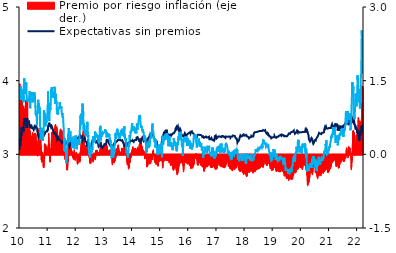
| Category | Premio por riesgo inflación (eje der.) |
|---|---|
| 2010-01-01 | 0.437 |
| 2010-01-04 | 1.435 |
| 2010-01-05 | 0.747 |
| 2010-01-06 | 1.172 |
| 2010-01-07 | 0.792 |
| 2010-01-08 | 1.109 |
| 2010-01-11 | 0.759 |
| 2010-01-12 | 0.645 |
| 2010-01-13 | 0.78 |
| 2010-01-14 | 0.892 |
| 2010-01-15 | 1.143 |
| 2010-01-18 | 1.323 |
| 2010-01-19 | 1.054 |
| 2010-01-20 | 0.948 |
| 2010-01-21 | 1.082 |
| 2010-01-22 | 0.902 |
| 2010-01-25 | 1.047 |
| 2010-01-26 | 0.965 |
| 2010-01-27 | 1.144 |
| 2010-01-28 | 0.8 |
| 2010-01-29 | 1.093 |
| 2010-02-01 | 1.084 |
| 2010-02-02 | 0.8 |
| 2010-02-03 | 0.903 |
| 2010-02-04 | 0.911 |
| 2010-02-05 | 0.894 |
| 2010-02-08 | 0.943 |
| 2010-02-09 | 0.974 |
| 2010-02-10 | 0.783 |
| 2010-02-11 | 0.743 |
| 2010-02-12 | 0.822 |
| 2010-02-15 | 0.922 |
| 2010-02-16 | 0.69 |
| 2010-02-17 | 0.694 |
| 2010-02-18 | 0.587 |
| 2010-02-19 | 0.915 |
| 2010-02-22 | 0.988 |
| 2010-02-23 | 0.779 |
| 2010-02-24 | 0.863 |
| 2010-02-25 | 0.722 |
| 2010-02-26 | 0.819 |
| 2010-03-01 | 0.888 |
| 2010-03-02 | 0.849 |
| 2010-03-03 | 0.8 |
| 2010-03-04 | 0.919 |
| 2010-03-05 | 0.868 |
| 2010-03-08 | 0.931 |
| 2010-03-09 | 0.779 |
| 2010-03-10 | 0.929 |
| 2010-03-11 | 0.758 |
| 2010-03-12 | 0.853 |
| 2010-03-15 | 0.615 |
| 2010-03-16 | 0.704 |
| 2010-03-17 | 0.689 |
| 2010-03-18 | 0.763 |
| 2010-03-19 | 1.072 |
| 2010-03-22 | 1.111 |
| 2010-03-23 | 1.083 |
| 2010-03-24 | 0.844 |
| 2010-03-25 | 0.927 |
| 2010-03-26 | 0.847 |
| 2010-03-29 | 0.821 |
| 2010-03-30 | 0.89 |
| 2010-03-31 | 1.185 |
| 2010-04-01 | 0.962 |
| 2010-04-02 | 0.962 |
| 2010-04-05 | 0.898 |
| 2010-04-06 | 0.86 |
| 2010-04-07 | 0.802 |
| 2010-04-08 | 0.709 |
| 2010-04-09 | 0.594 |
| 2010-04-12 | 1.137 |
| 2010-04-13 | 0.524 |
| 2010-04-14 | 0.622 |
| 2010-04-15 | 0.427 |
| 2010-04-16 | 0.212 |
| 2010-04-19 | 0.152 |
| 2010-04-20 | 0.221 |
| 2010-04-21 | 0.225 |
| 2010-04-22 | 0.392 |
| 2010-04-23 | 0.349 |
| 2010-04-26 | 0.366 |
| 2010-04-27 | 0.374 |
| 2010-04-28 | 0.43 |
| 2010-04-29 | 0.397 |
| 2010-04-30 | 0.475 |
| 2010-05-03 | 0.615 |
| 2010-05-04 | 0.496 |
| 2010-05-05 | 0.511 |
| 2010-05-06 | 0.608 |
| 2010-05-07 | 0.44 |
| 2010-05-10 | 0.519 |
| 2010-05-11 | 0.434 |
| 2010-05-12 | 0.437 |
| 2010-05-13 | 0.46 |
| 2010-05-14 | 0.428 |
| 2010-05-17 | 0.461 |
| 2010-05-18 | 0.411 |
| 2010-05-19 | 0.414 |
| 2010-05-20 | 0.389 |
| 2010-05-21 | 0.389 |
| 2010-05-24 | 0.229 |
| 2010-05-25 | 0.184 |
| 2010-05-26 | 0.168 |
| 2010-05-27 | 0.237 |
| 2010-05-28 | 0.24 |
| 2010-05-31 | 0.233 |
| 2010-06-01 | 0.229 |
| 2010-06-02 | 0.276 |
| 2010-06-03 | 0.297 |
| 2010-06-04 | 0.28 |
| 2010-06-07 | 0.327 |
| 2010-06-08 | 0.325 |
| 2010-06-09 | 0.33 |
| 2010-06-10 | 0.367 |
| 2010-06-11 | 0.369 |
| 2010-06-14 | 0.385 |
| 2010-06-15 | 0.358 |
| 2010-06-16 | 0.432 |
| 2010-06-17 | 0.445 |
| 2010-06-18 | 0.415 |
| 2010-06-21 | 0.397 |
| 2010-06-22 | 0.313 |
| 2010-06-23 | 0.291 |
| 2010-06-24 | 0.332 |
| 2010-06-25 | 0.332 |
| 2010-06-28 | 0.332 |
| 2010-06-29 | 0.322 |
| 2010-06-30 | 0.313 |
| 2010-07-01 | 0.319 |
| 2010-07-02 | 0.325 |
| 2010-07-05 | 0.308 |
| 2010-07-06 | 0.307 |
| 2010-07-07 | 0.362 |
| 2010-07-08 | 0.346 |
| 2010-07-09 | 0.359 |
| 2010-07-12 | 0.369 |
| 2010-07-13 | 0.413 |
| 2010-07-14 | 0.416 |
| 2010-07-15 | 0.418 |
| 2010-07-16 | 0.418 |
| 2010-07-19 | 0.415 |
| 2010-07-20 | 0.427 |
| 2010-07-21 | 0.43 |
| 2010-07-22 | 0.418 |
| 2010-07-23 | 0.414 |
| 2010-07-26 | 0.412 |
| 2010-07-27 | 0.409 |
| 2010-07-28 | 0.392 |
| 2010-07-29 | 0.286 |
| 2010-07-30 | 0.278 |
| 2010-08-02 | 0.273 |
| 2010-08-03 | 0.169 |
| 2010-08-04 | 0.148 |
| 2010-08-05 | 0.148 |
| 2010-08-06 | 0.112 |
| 2010-08-09 | 0.156 |
| 2010-08-10 | 0.147 |
| 2010-08-11 | 0.064 |
| 2010-08-12 | 0.052 |
| 2010-08-13 | 0.091 |
| 2010-08-16 | 0.067 |
| 2010-08-17 | 0.08 |
| 2010-08-18 | 0.075 |
| 2010-08-19 | -0.002 |
| 2010-08-20 | -0.025 |
| 2010-08-23 | -0.024 |
| 2010-08-24 | 0.074 |
| 2010-08-25 | 0.127 |
| 2010-08-26 | 0.226 |
| 2010-08-27 | 0.262 |
| 2010-08-30 | 0.276 |
| 2010-08-31 | 0.316 |
| 2010-09-01 | 0.39 |
| 2010-09-02 | 0.368 |
| 2010-09-03 | 0.406 |
| 2010-09-06 | 0.46 |
| 2010-09-07 | 0.491 |
| 2010-09-08 | 0.527 |
| 2010-09-09 | 0.493 |
| 2010-09-10 | 0.489 |
| 2010-09-13 | 0.495 |
| 2010-09-14 | 0.499 |
| 2010-09-15 | 0.432 |
| 2010-09-16 | 0.477 |
| 2010-09-17 | 0.477 |
| 2010-09-20 | 0.477 |
| 2010-09-21 | 0.415 |
| 2010-09-22 | 0.408 |
| 2010-09-23 | 0.346 |
| 2010-09-24 | 0.388 |
| 2010-09-27 | 0.426 |
| 2010-09-28 | 0.424 |
| 2010-09-29 | 0.354 |
| 2010-09-30 | 0.166 |
| 2010-10-01 | 0.187 |
| 2010-10-04 | 0.115 |
| 2010-10-05 | 0.044 |
| 2010-10-06 | 0.015 |
| 2010-10-07 | -0.025 |
| 2010-10-08 | -0.108 |
| 2010-10-11 | -0.108 |
| 2010-10-12 | -0.126 |
| 2010-10-13 | -0.15 |
| 2010-10-14 | -0.147 |
| 2010-10-15 | -0.139 |
| 2010-10-18 | -0.131 |
| 2010-10-19 | -0.082 |
| 2010-10-20 | -0.012 |
| 2010-10-21 | 0.041 |
| 2010-10-22 | 0.046 |
| 2010-10-25 | -0.012 |
| 2010-10-26 | -0.063 |
| 2010-10-27 | -0.116 |
| 2010-10-28 | -0.097 |
| 2010-10-29 | -0.084 |
| 2010-11-01 | -0.084 |
| 2010-11-02 | -0.124 |
| 2010-11-03 | -0.219 |
| 2010-11-04 | -0.256 |
| 2010-11-05 | -0.254 |
| 2010-11-08 | -0.26 |
| 2010-11-09 | -0.26 |
| 2010-11-10 | -0.195 |
| 2010-11-11 | -0.159 |
| 2010-11-12 | -0.071 |
| 2010-11-15 | -0.091 |
| 2010-11-16 | -0.087 |
| 2010-11-17 | -0.08 |
| 2010-11-18 | 0.054 |
| 2010-11-19 | 0.198 |
| 2010-11-22 | 0.218 |
| 2010-11-23 | 0.167 |
| 2010-11-24 | 0.138 |
| 2010-11-25 | 0.14 |
| 2010-11-26 | 0.158 |
| 2010-11-29 | 0.163 |
| 2010-11-30 | 0.2 |
| 2010-12-01 | 0.178 |
| 2010-12-02 | 0.196 |
| 2010-12-03 | 0.163 |
| 2010-12-06 | 0.169 |
| 2010-12-07 | 0.115 |
| 2010-12-08 | 0.115 |
| 2010-12-09 | 0.145 |
| 2010-12-10 | 0.008 |
| 2010-12-13 | 0.014 |
| 2010-12-14 | 0.062 |
| 2010-12-15 | 0.123 |
| 2010-12-16 | 0.149 |
| 2010-12-17 | 0.113 |
| 2010-12-20 | 0.118 |
| 2010-12-21 | 0.079 |
| 2010-12-22 | 0.064 |
| 2010-12-23 | 0.039 |
| 2010-12-24 | 0.036 |
| 2010-12-27 | 0.061 |
| 2010-12-28 | 0.057 |
| 2010-12-29 | 0.081 |
| 2010-12-30 | 0.079 |
| 2010-12-31 | 0.079 |
| 2011-01-03 | 0.08 |
| 2011-01-04 | 0.114 |
| 2011-01-05 | 0.16 |
| 2011-01-06 | 0.136 |
| 2011-01-07 | 0.197 |
| 2011-01-10 | 0.219 |
| 2011-01-11 | 0.268 |
| 2011-01-12 | 0.432 |
| 2011-01-13 | 0.348 |
| 2011-01-14 | 0.215 |
| 2011-01-17 | 0.206 |
| 2011-01-18 | 0.136 |
| 2011-01-19 | 0.061 |
| 2011-01-20 | -0.005 |
| 2011-01-21 | 0 |
| 2011-01-24 | -0.012 |
| 2011-01-25 | -0.093 |
| 2011-01-26 | -0.12 |
| 2011-01-27 | -0.143 |
| 2011-01-28 | -0.149 |
| 2011-01-31 | -0.127 |
| 2011-02-01 | -0.094 |
| 2011-02-02 | -0.093 |
| 2011-02-03 | 0.069 |
| 2011-02-04 | 0.105 |
| 2011-02-07 | 0.125 |
| 2011-02-08 | 0.102 |
| 2011-02-09 | 0.078 |
| 2011-02-10 | 0.077 |
| 2011-02-11 | 0.09 |
| 2011-02-14 | 0.112 |
| 2011-02-15 | 0.119 |
| 2011-02-16 | 0.228 |
| 2011-02-17 | 0.275 |
| 2011-02-18 | 0.312 |
| 2011-02-21 | 0.368 |
| 2011-02-22 | 0.455 |
| 2011-02-23 | 0.415 |
| 2011-02-24 | 0.42 |
| 2011-02-25 | 0.397 |
| 2011-02-28 | 0.408 |
| 2011-03-01 | 0.444 |
| 2011-03-02 | 0.449 |
| 2011-03-03 | 0.419 |
| 2011-03-04 | 0.35 |
| 2011-03-07 | 0.331 |
| 2011-03-08 | 0.34 |
| 2011-03-09 | 0.324 |
| 2011-03-10 | 0.352 |
| 2011-03-11 | 0.387 |
| 2011-03-14 | 0.445 |
| 2011-03-15 | 0.479 |
| 2011-03-16 | 0.461 |
| 2011-03-17 | 0.478 |
| 2011-03-18 | 0.456 |
| 2011-03-21 | 0.472 |
| 2011-03-22 | 0.46 |
| 2011-03-23 | 0.472 |
| 2011-03-24 | 0.461 |
| 2011-03-25 | 0.479 |
| 2011-03-28 | 0.495 |
| 2011-03-29 | 0.516 |
| 2011-03-30 | 0.514 |
| 2011-03-31 | 0.484 |
| 2011-04-01 | 0.516 |
| 2011-04-04 | 0.534 |
| 2011-04-05 | 0.528 |
| 2011-04-06 | 0.554 |
| 2011-04-07 | 0.599 |
| 2011-04-08 | 0.597 |
| 2011-04-11 | 0.609 |
| 2011-04-12 | 0.498 |
| 2011-04-13 | 0.438 |
| 2011-04-14 | 0.415 |
| 2011-04-15 | 0.387 |
| 2011-04-18 | 0.408 |
| 2011-04-19 | 0.491 |
| 2011-04-20 | 0.542 |
| 2011-04-21 | 0.543 |
| 2011-04-22 | 0.543 |
| 2011-04-25 | 0.54 |
| 2011-04-26 | 0.564 |
| 2011-04-27 | 0.528 |
| 2011-04-28 | 0.495 |
| 2011-04-29 | 0.456 |
| 2011-05-02 | 0.471 |
| 2011-05-03 | 0.475 |
| 2011-05-04 | 0.451 |
| 2011-05-05 | 0.394 |
| 2011-05-06 | 0.348 |
| 2011-05-09 | 0.33 |
| 2011-05-10 | 0.357 |
| 2011-05-11 | 0.327 |
| 2011-05-12 | 0.349 |
| 2011-05-13 | 0.346 |
| 2011-05-16 | 0.337 |
| 2011-05-17 | 0.337 |
| 2011-05-18 | 0.342 |
| 2011-05-19 | 0.319 |
| 2011-05-20 | 0.297 |
| 2011-05-23 | 0.291 |
| 2011-05-24 | 0.285 |
| 2011-05-25 | 0.277 |
| 2011-05-26 | 0.286 |
| 2011-05-27 | 0.37 |
| 2011-05-30 | 0.386 |
| 2011-05-31 | 0.389 |
| 2011-06-01 | 0.386 |
| 2011-06-02 | 0.409 |
| 2011-06-03 | 0.418 |
| 2011-06-06 | 0.426 |
| 2011-06-07 | 0.431 |
| 2011-06-08 | 0.427 |
| 2011-06-09 | 0.461 |
| 2011-06-10 | 0.463 |
| 2011-06-13 | 0.514 |
| 2011-06-14 | 0.516 |
| 2011-06-15 | 0.486 |
| 2011-06-16 | 0.483 |
| 2011-06-17 | 0.49 |
| 2011-06-20 | 0.49 |
| 2011-06-21 | 0.494 |
| 2011-06-22 | 0.472 |
| 2011-06-23 | 0.459 |
| 2011-06-24 | 0.453 |
| 2011-06-27 | 0.453 |
| 2011-06-28 | 0.446 |
| 2011-06-29 | 0.444 |
| 2011-06-30 | 0.463 |
| 2011-07-01 | 0.463 |
| 2011-07-04 | 0.456 |
| 2011-07-05 | 0.478 |
| 2011-07-06 | 0.46 |
| 2011-07-07 | 0.427 |
| 2011-07-08 | 0.404 |
| 2011-07-11 | 0.388 |
| 2011-07-12 | 0.383 |
| 2011-07-13 | 0.395 |
| 2011-07-14 | 0.378 |
| 2011-07-15 | 0.374 |
| 2011-07-18 | 0.391 |
| 2011-07-19 | 0.411 |
| 2011-07-20 | 0.377 |
| 2011-07-21 | 0.364 |
| 2011-07-22 | 0.326 |
| 2011-07-25 | 0.334 |
| 2011-07-26 | 0.348 |
| 2011-07-27 | 0.333 |
| 2011-07-28 | 0.313 |
| 2011-07-29 | 0.273 |
| 2011-08-01 | 0.257 |
| 2011-08-02 | 0.23 |
| 2011-08-03 | 0.196 |
| 2011-08-04 | 0.132 |
| 2011-08-05 | 0.083 |
| 2011-08-08 | 0.064 |
| 2011-08-09 | 0.017 |
| 2011-08-10 | -0.093 |
| 2011-08-11 | -0.038 |
| 2011-08-12 | 0.017 |
| 2011-08-15 | 0.017 |
| 2011-08-16 | 0.041 |
| 2011-08-17 | 0.096 |
| 2011-08-18 | 0.055 |
| 2011-08-19 | -0.081 |
| 2011-08-22 | -0.03 |
| 2011-08-23 | -0.069 |
| 2011-08-24 | -0.071 |
| 2011-08-25 | -0.103 |
| 2011-08-26 | -0.092 |
| 2011-08-29 | -0.06 |
| 2011-08-30 | -0.079 |
| 2011-08-31 | -0.068 |
| 2011-09-01 | -0.075 |
| 2011-09-02 | -0.136 |
| 2011-09-05 | -0.236 |
| 2011-09-06 | -0.312 |
| 2011-09-07 | -0.302 |
| 2011-09-08 | -0.29 |
| 2011-09-09 | -0.249 |
| 2011-09-12 | -0.299 |
| 2011-09-13 | -0.261 |
| 2011-09-14 | -0.199 |
| 2011-09-15 | -0.155 |
| 2011-09-16 | -0.137 |
| 2011-09-19 | -0.137 |
| 2011-09-20 | -0.087 |
| 2011-09-21 | 0.013 |
| 2011-09-22 | 0.009 |
| 2011-09-23 | 0.022 |
| 2011-09-26 | -0.028 |
| 2011-09-27 | -0.025 |
| 2011-09-28 | -0.017 |
| 2011-09-29 | 0.051 |
| 2011-09-30 | 0.128 |
| 2011-10-03 | 0.117 |
| 2011-10-04 | 0.087 |
| 2011-10-05 | 0.144 |
| 2011-10-06 | 0.18 |
| 2011-10-07 | 0.235 |
| 2011-10-10 | 0.235 |
| 2011-10-11 | 0.256 |
| 2011-10-12 | 0.22 |
| 2011-10-13 | 0.2 |
| 2011-10-14 | 0.177 |
| 2011-10-17 | 0.112 |
| 2011-10-18 | 0.051 |
| 2011-10-19 | 0.038 |
| 2011-10-20 | -0.005 |
| 2011-10-21 | 0.032 |
| 2011-10-24 | 0.062 |
| 2011-10-25 | 0.054 |
| 2011-10-26 | 0.044 |
| 2011-10-27 | 0.163 |
| 2011-10-28 | 0.114 |
| 2011-10-31 | 0.114 |
| 2011-11-01 | 0.114 |
| 2011-11-02 | 0.082 |
| 2011-11-03 | 0.068 |
| 2011-11-04 | 0.06 |
| 2011-11-07 | 0.073 |
| 2011-11-08 | 0.053 |
| 2011-11-09 | 0.055 |
| 2011-11-10 | 0.042 |
| 2011-11-11 | 0.037 |
| 2011-11-14 | 0.01 |
| 2011-11-15 | -0.01 |
| 2011-11-16 | 0.029 |
| 2011-11-17 | -0.004 |
| 2011-11-18 | -0.033 |
| 2011-11-21 | 0.013 |
| 2011-11-22 | -0.042 |
| 2011-11-23 | -0.058 |
| 2011-11-24 | -0.061 |
| 2011-11-25 | -0.05 |
| 2011-11-28 | -0.053 |
| 2011-11-29 | -0.095 |
| 2011-11-30 | -0.08 |
| 2011-12-01 | 0.014 |
| 2011-12-02 | 0.023 |
| 2011-12-05 | 0.025 |
| 2011-12-06 | 0.013 |
| 2011-12-07 | 0.052 |
| 2011-12-08 | 0.052 |
| 2011-12-09 | 0.096 |
| 2011-12-12 | 0.012 |
| 2011-12-13 | -0.006 |
| 2011-12-14 | -0.018 |
| 2011-12-15 | -0.033 |
| 2011-12-16 | -0.039 |
| 2011-12-19 | -0.044 |
| 2011-12-20 | -0.093 |
| 2011-12-21 | -0.117 |
| 2011-12-22 | -0.095 |
| 2011-12-23 | -0.086 |
| 2011-12-26 | -0.085 |
| 2011-12-27 | -0.074 |
| 2011-12-28 | -0.052 |
| 2011-12-29 | -0.033 |
| 2011-12-30 | -0.034 |
| 2012-01-02 | 0.013 |
| 2012-01-03 | 0.039 |
| 2012-01-04 | 0.022 |
| 2012-01-05 | 0.04 |
| 2012-01-06 | 0.017 |
| 2012-01-09 | -0.009 |
| 2012-01-10 | -0.021 |
| 2012-01-11 | -0.019 |
| 2012-01-12 | -0.019 |
| 2012-01-13 | -0.014 |
| 2012-01-16 | -0.009 |
| 2012-01-17 | -0.07 |
| 2012-01-18 | -0.134 |
| 2012-01-19 | -0.17 |
| 2012-01-20 | -0.192 |
| 2012-01-23 | -0.186 |
| 2012-01-24 | -0.162 |
| 2012-01-25 | -0.164 |
| 2012-01-26 | -0.114 |
| 2012-01-27 | -0.048 |
| 2012-01-30 | -0.107 |
| 2012-01-31 | -0.061 |
| 2012-02-01 | -0.09 |
| 2012-02-02 | -0.062 |
| 2012-02-03 | -0.093 |
| 2012-02-06 | -0.086 |
| 2012-02-07 | -0.08 |
| 2012-02-08 | -0.093 |
| 2012-02-09 | -0.11 |
| 2012-02-10 | -0.118 |
| 2012-02-13 | -0.123 |
| 2012-02-14 | -0.108 |
| 2012-02-15 | -0.115 |
| 2012-02-16 | -0.127 |
| 2012-02-17 | -0.138 |
| 2012-02-20 | -0.151 |
| 2012-02-21 | -0.087 |
| 2012-02-22 | -0.106 |
| 2012-02-23 | -0.062 |
| 2012-02-24 | 0.019 |
| 2012-02-27 | 0.04 |
| 2012-02-28 | 0.075 |
| 2012-02-29 | 0.052 |
| 2012-03-01 | 0.04 |
| 2012-03-02 | 0.069 |
| 2012-03-05 | 0.121 |
| 2012-03-06 | 0.091 |
| 2012-03-07 | 0.126 |
| 2012-03-08 | 0.238 |
| 2012-03-09 | 0.198 |
| 2012-03-12 | 0.148 |
| 2012-03-13 | 0.181 |
| 2012-03-14 | 0.287 |
| 2012-03-15 | 0.217 |
| 2012-03-16 | 0.21 |
| 2012-03-19 | 0.258 |
| 2012-03-20 | 0.23 |
| 2012-03-21 | 0.171 |
| 2012-03-22 | 0.138 |
| 2012-03-23 | 0.16 |
| 2012-03-26 | 0.143 |
| 2012-03-27 | 0.133 |
| 2012-03-28 | 0.129 |
| 2012-03-29 | 0.195 |
| 2012-03-30 | 0.349 |
| 2012-04-02 | 0.42 |
| 2012-04-03 | 0.402 |
| 2012-04-04 | 0.438 |
| 2012-04-05 | 0.483 |
| 2012-04-06 | 0.483 |
| 2012-04-09 | 0.483 |
| 2012-04-10 | 0.427 |
| 2012-04-11 | 0.366 |
| 2012-04-12 | 0.382 |
| 2012-04-13 | 0.292 |
| 2012-04-16 | 0.226 |
| 2012-04-17 | 0.191 |
| 2012-04-18 | 0.145 |
| 2012-04-19 | 0.087 |
| 2012-04-20 | 0.149 |
| 2012-04-23 | 0.153 |
| 2012-04-24 | 0.194 |
| 2012-04-25 | 0.139 |
| 2012-04-26 | 0.137 |
| 2012-04-27 | 0.169 |
| 2012-04-30 | 0.17 |
| 2012-05-01 | 0.17 |
| 2012-05-02 | 0.104 |
| 2012-05-03 | 0.043 |
| 2012-05-04 | 0.027 |
| 2012-05-07 | 0.093 |
| 2012-05-08 | 0.093 |
| 2012-05-09 | 0.087 |
| 2012-05-10 | 0.112 |
| 2012-05-11 | 0.112 |
| 2012-05-14 | 0.13 |
| 2012-05-15 | 0.084 |
| 2012-05-16 | 0.079 |
| 2012-05-17 | 0.085 |
| 2012-05-18 | 0.128 |
| 2012-05-21 | 0.128 |
| 2012-05-22 | 0.134 |
| 2012-05-23 | 0.058 |
| 2012-05-24 | 0.045 |
| 2012-05-25 | 0.093 |
| 2012-05-28 | 0.098 |
| 2012-05-29 | 0.156 |
| 2012-05-30 | 0.131 |
| 2012-05-31 | 0.159 |
| 2012-06-01 | 0.252 |
| 2012-06-04 | 0.288 |
| 2012-06-05 | 0.31 |
| 2012-06-06 | 0.297 |
| 2012-06-07 | 0.29 |
| 2012-06-08 | 0.274 |
| 2012-06-11 | 0.243 |
| 2012-06-12 | 0.177 |
| 2012-06-13 | 0.127 |
| 2012-06-14 | 0.071 |
| 2012-06-15 | 0.064 |
| 2012-06-18 | 0.097 |
| 2012-06-19 | 0.043 |
| 2012-06-20 | 0.018 |
| 2012-06-21 | -0.055 |
| 2012-06-22 | -0.053 |
| 2012-06-25 | -0.071 |
| 2012-06-26 | -0.073 |
| 2012-06-27 | -0.136 |
| 2012-06-28 | -0.169 |
| 2012-06-29 | -0.075 |
| 2012-07-02 | -0.075 |
| 2012-07-03 | -0.013 |
| 2012-07-04 | -0.048 |
| 2012-07-05 | -0.18 |
| 2012-07-06 | -0.136 |
| 2012-07-09 | -0.126 |
| 2012-07-10 | -0.101 |
| 2012-07-11 | -0.12 |
| 2012-07-12 | -0.174 |
| 2012-07-13 | -0.087 |
| 2012-07-16 | -0.087 |
| 2012-07-17 | -0.041 |
| 2012-07-18 | -0.01 |
| 2012-07-19 | -0.093 |
| 2012-07-20 | -0.109 |
| 2012-07-23 | -0.111 |
| 2012-07-24 | -0.104 |
| 2012-07-25 | -0.103 |
| 2012-07-26 | -0.128 |
| 2012-07-27 | -0.034 |
| 2012-07-30 | -0.031 |
| 2012-07-31 | -0.123 |
| 2012-08-01 | -0.115 |
| 2012-08-02 | -0.091 |
| 2012-08-03 | -0.064 |
| 2012-08-06 | -0.116 |
| 2012-08-07 | -0.12 |
| 2012-08-08 | -0.1 |
| 2012-08-09 | -0.15 |
| 2012-08-10 | -0.131 |
| 2012-08-13 | -0.126 |
| 2012-08-14 | -0.076 |
| 2012-08-15 | -0.076 |
| 2012-08-16 | -0.011 |
| 2012-08-17 | -0.044 |
| 2012-08-20 | -0.028 |
| 2012-08-21 | 0.033 |
| 2012-08-22 | 0.011 |
| 2012-08-23 | -0.02 |
| 2012-08-24 | -0.065 |
| 2012-08-27 | -0.048 |
| 2012-08-28 | -0.035 |
| 2012-08-29 | -0.055 |
| 2012-08-30 | -0.049 |
| 2012-08-31 | -0.044 |
| 2012-09-03 | -0.072 |
| 2012-09-04 | -0.081 |
| 2012-09-05 | -0.105 |
| 2012-09-06 | -0.064 |
| 2012-09-07 | -0.076 |
| 2012-09-10 | -0.072 |
| 2012-09-11 | -0.049 |
| 2012-09-12 | 0.004 |
| 2012-09-13 | 0.028 |
| 2012-09-14 | 0.079 |
| 2012-09-17 | 0.079 |
| 2012-09-18 | 0.079 |
| 2012-09-19 | 0.079 |
| 2012-09-20 | 0.069 |
| 2012-09-21 | 0.053 |
| 2012-09-24 | 0.046 |
| 2012-09-25 | 0.042 |
| 2012-09-26 | 0.048 |
| 2012-09-27 | 0.081 |
| 2012-09-28 | 0.082 |
| 2012-10-01 | 0.08 |
| 2012-10-02 | 0.056 |
| 2012-10-03 | 0.056 |
| 2012-10-04 | 0.048 |
| 2012-10-05 | 0.044 |
| 2012-10-08 | 0.053 |
| 2012-10-09 | 0.017 |
| 2012-10-10 | 0.022 |
| 2012-10-11 | 0.042 |
| 2012-10-12 | 0.03 |
| 2012-10-15 | 0.03 |
| 2012-10-16 | 0.008 |
| 2012-10-17 | 0.006 |
| 2012-10-18 | 0.007 |
| 2012-10-19 | 0.001 |
| 2012-10-22 | 0.014 |
| 2012-10-23 | 0.009 |
| 2012-10-24 | 0.006 |
| 2012-10-25 | 0.03 |
| 2012-10-26 | -0.008 |
| 2012-10-29 | -0.01 |
| 2012-10-30 | 0 |
| 2012-10-31 | -0.003 |
| 2012-11-01 | -0.003 |
| 2012-11-02 | -0.003 |
| 2012-11-05 | 0.023 |
| 2012-11-06 | 0.043 |
| 2012-11-07 | 0.032 |
| 2012-11-08 | 0.093 |
| 2012-11-09 | 0.061 |
| 2012-11-12 | 0.078 |
| 2012-11-13 | 0.138 |
| 2012-11-14 | 0.156 |
| 2012-11-15 | 0.172 |
| 2012-11-16 | 0.222 |
| 2012-11-19 | 0.219 |
| 2012-11-20 | 0.179 |
| 2012-11-21 | 0.218 |
| 2012-11-22 | 0.238 |
| 2012-11-23 | 0.254 |
| 2012-11-26 | 0.214 |
| 2012-11-27 | 0.047 |
| 2012-11-28 | 0.002 |
| 2012-11-29 | 0.019 |
| 2012-11-30 | 0.044 |
| 2012-12-03 | 0.048 |
| 2012-12-04 | 0.065 |
| 2012-12-05 | 0.072 |
| 2012-12-06 | 0.105 |
| 2012-12-07 | 0.091 |
| 2012-12-10 | 0.112 |
| 2012-12-11 | 0.116 |
| 2012-12-12 | 0.122 |
| 2012-12-13 | 0.158 |
| 2012-12-14 | 0.143 |
| 2012-12-17 | 0.155 |
| 2012-12-18 | 0.158 |
| 2012-12-19 | 0.158 |
| 2012-12-20 | 0.171 |
| 2012-12-21 | 0.169 |
| 2012-12-24 | 0.166 |
| 2012-12-25 | 0.166 |
| 2012-12-26 | 0.148 |
| 2012-12-27 | 0.145 |
| 2012-12-28 | 0.143 |
| 2012-12-31 | 0.143 |
| 2013-01-01 | 0.143 |
| 2013-01-02 | 0.135 |
| 2013-01-03 | 0.149 |
| 2013-01-04 | 0.163 |
| 2013-01-07 | 0.158 |
| 2013-01-08 | 0.129 |
| 2013-01-09 | 0.133 |
| 2013-01-10 | 0.141 |
| 2013-01-11 | 0.149 |
| 2013-01-14 | 0.142 |
| 2013-01-15 | 0.142 |
| 2013-01-16 | 0.14 |
| 2013-01-17 | 0.138 |
| 2013-01-18 | 0.15 |
| 2013-01-21 | 0.148 |
| 2013-01-22 | 0.18 |
| 2013-01-23 | 0.192 |
| 2013-01-24 | 0.142 |
| 2013-01-25 | 0.145 |
| 2013-01-28 | 0.184 |
| 2013-01-29 | 0.197 |
| 2013-01-30 | 0.2 |
| 2013-01-31 | 0.199 |
| 2013-02-01 | 0.174 |
| 2013-02-04 | 0.166 |
| 2013-02-05 | 0.161 |
| 2013-02-06 | 0.138 |
| 2013-02-07 | 0.103 |
| 2013-02-08 | 0.078 |
| 2013-02-11 | 0.058 |
| 2013-02-12 | 0.006 |
| 2013-02-13 | 0.059 |
| 2013-02-14 | 0.078 |
| 2013-02-15 | 0.061 |
| 2013-02-18 | 0.073 |
| 2013-02-19 | 0.078 |
| 2013-02-20 | 0.079 |
| 2013-02-21 | 0.05 |
| 2013-02-22 | 0.043 |
| 2013-02-25 | 0.024 |
| 2013-02-26 | 0.016 |
| 2013-02-27 | 0.031 |
| 2013-02-28 | 0.05 |
| 2013-03-01 | 0.035 |
| 2013-03-04 | 0.041 |
| 2013-03-05 | 0.056 |
| 2013-03-06 | 0.079 |
| 2013-03-07 | 0.077 |
| 2013-03-08 | 0.064 |
| 2013-03-11 | 0.058 |
| 2013-03-12 | 0.082 |
| 2013-03-13 | 0.056 |
| 2013-03-14 | 0.058 |
| 2013-03-15 | 0.077 |
| 2013-03-18 | 0.099 |
| 2013-03-19 | 0.08 |
| 2013-03-20 | 0.07 |
| 2013-03-21 | 0.068 |
| 2013-03-22 | 0.049 |
| 2013-03-25 | 0.065 |
| 2013-03-26 | 0.056 |
| 2013-03-27 | 0.049 |
| 2013-03-28 | 0.001 |
| 2013-03-29 | 0.001 |
| 2013-04-01 | 0.03 |
| 2013-04-02 | 0.049 |
| 2013-04-03 | 0.062 |
| 2013-04-04 | 0.012 |
| 2013-04-05 | -0.028 |
| 2013-04-08 | -0.043 |
| 2013-04-09 | -0.051 |
| 2013-04-10 | -0.061 |
| 2013-04-11 | -0.062 |
| 2013-04-12 | -0.02 |
| 2013-04-15 | -0.046 |
| 2013-04-16 | -0.179 |
| 2013-04-17 | -0.208 |
| 2013-04-18 | -0.145 |
| 2013-04-19 | -0.123 |
| 2013-04-22 | -0.1 |
| 2013-04-23 | -0.097 |
| 2013-04-24 | -0.083 |
| 2013-04-25 | -0.113 |
| 2013-04-26 | -0.132 |
| 2013-04-29 | -0.148 |
| 2013-04-30 | -0.157 |
| 2013-05-01 | -0.157 |
| 2013-05-02 | -0.132 |
| 2013-05-03 | -0.098 |
| 2013-05-06 | -0.048 |
| 2013-05-07 | -0.045 |
| 2013-05-08 | -0.151 |
| 2013-05-09 | -0.168 |
| 2013-05-10 | -0.096 |
| 2013-05-13 | -0.045 |
| 2013-05-14 | -0.003 |
| 2013-05-15 | -0.019 |
| 2013-05-16 | -0.072 |
| 2013-05-17 | -0.061 |
| 2013-05-20 | -0.128 |
| 2013-05-21 | -0.128 |
| 2013-05-22 | -0.089 |
| 2013-05-23 | -0.082 |
| 2013-05-24 | -0.065 |
| 2013-05-27 | -0.073 |
| 2013-05-28 | -0.053 |
| 2013-05-29 | -0.059 |
| 2013-05-30 | -0.056 |
| 2013-05-31 | -0.034 |
| 2013-06-03 | 0.052 |
| 2013-06-04 | 0.08 |
| 2013-06-05 | 0.066 |
| 2013-06-06 | 0.114 |
| 2013-06-07 | 0.118 |
| 2013-06-10 | 0.055 |
| 2013-06-11 | 0.051 |
| 2013-06-12 | 0.045 |
| 2013-06-13 | 0.009 |
| 2013-06-14 | 0.033 |
| 2013-06-17 | 0.048 |
| 2013-06-18 | 0.071 |
| 2013-06-19 | 0.078 |
| 2013-06-20 | 0.106 |
| 2013-06-21 | 0.088 |
| 2013-06-24 | 0.101 |
| 2013-06-25 | 0.09 |
| 2013-06-26 | 0.084 |
| 2013-06-27 | 0.11 |
| 2013-06-28 | 0.175 |
| 2013-07-01 | 0.195 |
| 2013-07-02 | 0.167 |
| 2013-07-03 | 0.16 |
| 2013-07-04 | 0.156 |
| 2013-07-05 | 0.128 |
| 2013-07-08 | 0.126 |
| 2013-07-09 | 0.092 |
| 2013-07-10 | 0.061 |
| 2013-07-11 | 0.077 |
| 2013-07-12 | 0.065 |
| 2013-07-15 | 0.027 |
| 2013-07-16 | 0.027 |
| 2013-07-17 | 0.027 |
| 2013-07-18 | 0.029 |
| 2013-07-19 | 0.028 |
| 2013-07-22 | 0.02 |
| 2013-07-23 | 0.016 |
| 2013-07-24 | 0.046 |
| 2013-07-25 | 0.02 |
| 2013-07-26 | 0.012 |
| 2013-07-29 | 0.015 |
| 2013-07-30 | -0.01 |
| 2013-07-31 | 0.016 |
| 2013-08-01 | 0.046 |
| 2013-08-02 | 0.016 |
| 2013-08-05 | 0.025 |
| 2013-08-06 | 0.032 |
| 2013-08-07 | 0.04 |
| 2013-08-08 | 0.046 |
| 2013-08-09 | 0.049 |
| 2013-08-12 | 0.052 |
| 2013-08-13 | 0.04 |
| 2013-08-14 | 0.056 |
| 2013-08-15 | 0.056 |
| 2013-08-16 | 0.123 |
| 2013-08-19 | 0.119 |
| 2013-08-20 | 0.121 |
| 2013-08-21 | 0.119 |
| 2013-08-22 | 0.112 |
| 2013-08-23 | 0.091 |
| 2013-08-26 | 0.059 |
| 2013-08-27 | 0.035 |
| 2013-08-28 | 0.029 |
| 2013-08-29 | 0.052 |
| 2013-08-30 | 0.104 |
| 2013-09-02 | 0.086 |
| 2013-09-03 | 0.107 |
| 2013-09-04 | 0.072 |
| 2013-09-05 | 0.136 |
| 2013-09-06 | 0.083 |
| 2013-09-09 | 0.092 |
| 2013-09-10 | 0.115 |
| 2013-09-11 | 0.061 |
| 2013-09-12 | 0.079 |
| 2013-09-13 | 0.05 |
| 2013-09-16 | 0.058 |
| 2013-09-17 | 0.061 |
| 2013-09-18 | 0.061 |
| 2013-09-19 | 0.061 |
| 2013-09-20 | 0.061 |
| 2013-09-23 | 0.059 |
| 2013-09-24 | 0.058 |
| 2013-09-25 | 0.099 |
| 2013-09-26 | 0.152 |
| 2013-09-27 | 0.186 |
| 2013-09-30 | 0.244 |
| 2013-10-01 | 0.202 |
| 2013-10-02 | 0.161 |
| 2013-10-03 | 0.116 |
| 2013-10-04 | 0.075 |
| 2013-10-07 | 0.129 |
| 2013-10-08 | 0.101 |
| 2013-10-09 | 0.044 |
| 2013-10-10 | 0.059 |
| 2013-10-11 | 0.038 |
| 2013-10-14 | 0.042 |
| 2013-10-15 | 0.039 |
| 2013-10-16 | 0.019 |
| 2013-10-17 | 0.02 |
| 2013-10-18 | -0.022 |
| 2013-10-21 | 0.012 |
| 2013-10-22 | -0.048 |
| 2013-10-23 | -0.084 |
| 2013-10-24 | -0.125 |
| 2013-10-25 | -0.147 |
| 2013-10-28 | -0.153 |
| 2013-10-29 | -0.204 |
| 2013-10-30 | -0.196 |
| 2013-10-31 | -0.196 |
| 2013-11-01 | -0.196 |
| 2013-11-04 | -0.16 |
| 2013-11-05 | -0.16 |
| 2013-11-06 | -0.173 |
| 2013-11-07 | -0.164 |
| 2013-11-08 | -0.165 |
| 2013-11-11 | -0.163 |
| 2013-11-12 | -0.235 |
| 2013-11-13 | -0.273 |
| 2013-11-14 | -0.291 |
| 2013-11-15 | -0.26 |
| 2013-11-18 | -0.255 |
| 2013-11-19 | -0.261 |
| 2013-11-20 | -0.237 |
| 2013-11-21 | -0.182 |
| 2013-11-22 | -0.16 |
| 2013-11-25 | -0.15 |
| 2013-11-26 | -0.127 |
| 2013-11-27 | -0.151 |
| 2013-11-28 | -0.149 |
| 2013-11-29 | -0.16 |
| 2013-12-02 | -0.162 |
| 2013-12-03 | -0.091 |
| 2013-12-04 | -0.043 |
| 2013-12-05 | -0.057 |
| 2013-12-06 | 0.027 |
| 2013-12-09 | -0.007 |
| 2013-12-10 | -0.045 |
| 2013-12-11 | -0.061 |
| 2013-12-12 | -0.061 |
| 2013-12-13 | -0.043 |
| 2013-12-16 | -0.052 |
| 2013-12-17 | -0.012 |
| 2013-12-18 | -0.002 |
| 2013-12-19 | 0.012 |
| 2013-12-20 | 0.05 |
| 2013-12-23 | 0.031 |
| 2013-12-24 | 0.04 |
| 2013-12-25 | 0.04 |
| 2013-12-26 | 0.046 |
| 2013-12-27 | 0.059 |
| 2013-12-30 | 0.082 |
| 2013-12-31 | 0.082 |
| 2014-01-01 | 0.082 |
| 2014-01-02 | 0.111 |
| 2014-01-03 | 0.115 |
| 2014-01-06 | 0.103 |
| 2014-01-07 | 0.094 |
| 2014-01-08 | 0.157 |
| 2014-01-09 | 0.14 |
| 2014-01-10 | 0.129 |
| 2014-01-13 | 0.101 |
| 2014-01-14 | 0.068 |
| 2014-01-15 | 0.047 |
| 2014-01-16 | 0.047 |
| 2014-01-17 | 0.021 |
| 2014-01-20 | 0.038 |
| 2014-01-21 | 0.066 |
| 2014-01-22 | 0.043 |
| 2014-01-23 | 0.052 |
| 2014-01-24 | 0.097 |
| 2014-01-27 | 0.087 |
| 2014-01-28 | 0.047 |
| 2014-01-29 | 0.088 |
| 2014-01-30 | 0.118 |
| 2014-01-31 | 0.121 |
| 2014-02-03 | 0.105 |
| 2014-02-04 | 0.112 |
| 2014-02-05 | 0.121 |
| 2014-02-06 | 0.103 |
| 2014-02-07 | 0.113 |
| 2014-02-10 | 0.095 |
| 2014-02-11 | 0.106 |
| 2014-02-12 | 0.055 |
| 2014-02-13 | 0.1 |
| 2014-02-14 | 0.113 |
| 2014-02-17 | 0.083 |
| 2014-02-18 | 0.06 |
| 2014-02-19 | 0.031 |
| 2014-02-20 | 0.023 |
| 2014-02-21 | 0.089 |
| 2014-02-24 | 0.105 |
| 2014-02-25 | 0.098 |
| 2014-02-26 | 0.054 |
| 2014-02-27 | 0.089 |
| 2014-02-28 | 0.1 |
| 2014-03-03 | 0.029 |
| 2014-03-04 | 0.09 |
| 2014-03-05 | 0.08 |
| 2014-03-06 | 0.101 |
| 2014-03-07 | 0.067 |
| 2014-03-10 | 0.105 |
| 2014-03-11 | 0.149 |
| 2014-03-12 | 0.104 |
| 2014-03-13 | 0.123 |
| 2014-03-14 | 0.104 |
| 2014-03-17 | 0.086 |
| 2014-03-18 | 0.078 |
| 2014-03-19 | 0.041 |
| 2014-03-20 | 0.05 |
| 2014-03-21 | 0.078 |
| 2014-03-24 | 0.123 |
| 2014-03-25 | 0.117 |
| 2014-03-26 | 0.123 |
| 2014-03-27 | 0.113 |
| 2014-03-28 | 0.106 |
| 2014-03-31 | 0.13 |
| 2014-04-01 | 0.112 |
| 2014-04-02 | 0.181 |
| 2014-04-03 | 0.184 |
| 2014-04-04 | 0.208 |
| 2014-04-07 | 0.219 |
| 2014-04-08 | 0.281 |
| 2014-04-09 | 0.282 |
| 2014-04-10 | 0.259 |
| 2014-04-11 | 0.244 |
| 2014-04-14 | 0.284 |
| 2014-04-15 | 0.304 |
| 2014-04-16 | 0.319 |
| 2014-04-17 | 0.327 |
| 2014-04-18 | 0.327 |
| 2014-04-21 | 0.322 |
| 2014-04-22 | 0.309 |
| 2014-04-23 | 0.3 |
| 2014-04-24 | 0.277 |
| 2014-04-25 | 0.225 |
| 2014-04-28 | 0.207 |
| 2014-04-29 | 0.183 |
| 2014-04-30 | 0.16 |
| 2014-05-01 | 0.16 |
| 2014-05-02 | 0.156 |
| 2014-05-05 | 0.142 |
| 2014-05-06 | 0.153 |
| 2014-05-07 | 0.163 |
| 2014-05-08 | 0.11 |
| 2014-05-09 | 0.127 |
| 2014-05-12 | 0.109 |
| 2014-05-13 | 0.095 |
| 2014-05-14 | 0.092 |
| 2014-05-15 | 0.1 |
| 2014-05-16 | 0.099 |
| 2014-05-19 | 0.088 |
| 2014-05-20 | 0.046 |
| 2014-05-21 | 0.046 |
| 2014-05-22 | 0.053 |
| 2014-05-23 | 0.079 |
| 2014-05-26 | 0.057 |
| 2014-05-27 | 0.015 |
| 2014-05-28 | 0.006 |
| 2014-05-29 | 0.016 |
| 2014-05-30 | 0.022 |
| 2014-06-02 | 0.027 |
| 2014-06-03 | 0.047 |
| 2014-06-04 | 0.041 |
| 2014-06-05 | 0.06 |
| 2014-06-06 | 0.042 |
| 2014-06-09 | 0.025 |
| 2014-06-10 | -0.007 |
| 2014-06-11 | -0.055 |
| 2014-06-12 | -0.08 |
| 2014-06-13 | -0.085 |
| 2014-06-16 | -0.045 |
| 2014-06-17 | -0.019 |
| 2014-06-18 | -0.018 |
| 2014-06-19 | -0.018 |
| 2014-06-20 | 0.001 |
| 2014-06-23 | 0.006 |
| 2014-06-24 | 0.023 |
| 2014-06-25 | 0.014 |
| 2014-06-26 | 0.029 |
| 2014-06-27 | 0.016 |
| 2014-06-30 | -0.013 |
| 2014-07-01 | -0.065 |
| 2014-07-02 | -0.063 |
| 2014-07-03 | -0.056 |
| 2014-07-04 | -0.079 |
| 2014-07-07 | -0.111 |
| 2014-07-08 | -0.104 |
| 2014-07-09 | -0.217 |
| 2014-07-10 | -0.25 |
| 2014-07-11 | -0.237 |
| 2014-07-14 | -0.191 |
| 2014-07-15 | -0.234 |
| 2014-07-16 | -0.234 |
| 2014-07-17 | -0.232 |
| 2014-07-18 | -0.207 |
| 2014-07-21 | -0.206 |
| 2014-07-22 | -0.135 |
| 2014-07-23 | -0.133 |
| 2014-07-24 | -0.138 |
| 2014-07-25 | -0.142 |
| 2014-07-28 | -0.131 |
| 2014-07-29 | -0.095 |
| 2014-07-30 | -0.129 |
| 2014-07-31 | -0.115 |
| 2014-08-01 | -0.124 |
| 2014-08-04 | -0.119 |
| 2014-08-05 | -0.087 |
| 2014-08-06 | -0.107 |
| 2014-08-07 | -0.118 |
| 2014-08-08 | -0.184 |
| 2014-08-11 | -0.179 |
| 2014-08-12 | -0.165 |
| 2014-08-13 | -0.123 |
| 2014-08-14 | -0.1 |
| 2014-08-15 | -0.1 |
| 2014-08-18 | -0.103 |
| 2014-08-19 | -0.123 |
| 2014-08-20 | -0.134 |
| 2014-08-21 | -0.18 |
| 2014-08-22 | -0.15 |
| 2014-08-25 | -0.153 |
| 2014-08-26 | -0.156 |
| 2014-08-27 | -0.175 |
| 2014-08-28 | -0.147 |
| 2014-08-29 | -0.104 |
| 2014-09-01 | -0.093 |
| 2014-09-02 | -0.09 |
| 2014-09-03 | -0.084 |
| 2014-09-04 | -0.05 |
| 2014-09-05 | -0.062 |
| 2014-09-08 | -0.069 |
| 2014-09-09 | -0.073 |
| 2014-09-10 | -0.093 |
| 2014-09-11 | -0.079 |
| 2014-09-12 | -0.087 |
| 2014-09-15 | -0.104 |
| 2014-09-16 | -0.096 |
| 2014-09-17 | -0.06 |
| 2014-09-18 | -0.06 |
| 2014-09-19 | -0.06 |
| 2014-09-22 | -0.022 |
| 2014-09-23 | 0.015 |
| 2014-09-24 | 0.068 |
| 2014-09-25 | 0.054 |
| 2014-09-26 | 0.029 |
| 2014-09-29 | 0.065 |
| 2014-09-30 | 0.094 |
| 2014-10-01 | 0.06 |
| 2014-10-02 | 0.052 |
| 2014-10-03 | 0.021 |
| 2014-10-06 | -0.007 |
| 2014-10-07 | -0.013 |
| 2014-10-08 | -0.011 |
| 2014-10-09 | -0.031 |
| 2014-10-10 | -0.008 |
| 2014-10-13 | 0.002 |
| 2014-10-14 | -0.038 |
| 2014-10-15 | -0.111 |
| 2014-10-16 | -0.106 |
| 2014-10-17 | -0.082 |
| 2014-10-20 | -0.095 |
| 2014-10-21 | -0.096 |
| 2014-10-22 | -0.155 |
| 2014-10-23 | -0.149 |
| 2014-10-24 | -0.144 |
| 2014-10-27 | -0.161 |
| 2014-10-28 | -0.134 |
| 2014-10-29 | -0.123 |
| 2014-10-30 | -0.113 |
| 2014-10-31 | -0.113 |
| 2014-11-03 | -0.092 |
| 2014-11-04 | -0.108 |
| 2014-11-05 | -0.179 |
| 2014-11-06 | -0.201 |
| 2014-11-07 | -0.169 |
| 2014-11-10 | -0.144 |
| 2014-11-11 | -0.113 |
| 2014-11-12 | -0.085 |
| 2014-11-13 | -0.111 |
| 2014-11-14 | -0.105 |
| 2014-11-17 | -0.117 |
| 2014-11-18 | -0.111 |
| 2014-11-19 | -0.115 |
| 2014-11-20 | -0.143 |
| 2014-11-21 | -0.136 |
| 2014-11-24 | -0.121 |
| 2014-11-25 | -0.133 |
| 2014-11-26 | -0.121 |
| 2014-11-27 | -0.176 |
| 2014-11-28 | -0.219 |
| 2014-12-01 | -0.235 |
| 2014-12-02 | -0.2 |
| 2014-12-03 | -0.141 |
| 2014-12-04 | -0.135 |
| 2014-12-05 | -0.096 |
| 2014-12-08 | -0.096 |
| 2014-12-09 | -0.097 |
| 2014-12-10 | -0.147 |
| 2014-12-11 | -0.144 |
| 2014-12-12 | -0.137 |
| 2014-12-15 | -0.104 |
| 2014-12-16 | -0.1 |
| 2014-12-17 | -0.117 |
| 2014-12-18 | -0.082 |
| 2014-12-19 | -0.085 |
| 2014-12-22 | -0.092 |
| 2014-12-23 | -0.072 |
| 2014-12-24 | -0.041 |
| 2014-12-25 | -0.041 |
| 2014-12-26 | -0.078 |
| 2014-12-29 | -0.095 |
| 2014-12-30 | -0.109 |
| 2014-12-31 | -0.109 |
| 2015-01-01 | -0.109 |
| 2015-01-02 | -0.098 |
| 2015-01-05 | -0.101 |
| 2015-01-06 | -0.12 |
| 2015-01-07 | -0.087 |
| 2015-01-08 | -0.122 |
| 2015-01-09 | -0.098 |
| 2015-01-12 | -0.1 |
| 2015-01-13 | -0.057 |
| 2015-01-14 | -0.054 |
| 2015-01-15 | -0.08 |
| 2015-01-16 | -0.088 |
| 2015-01-19 | -0.087 |
| 2015-01-20 | -0.127 |
| 2015-01-21 | -0.135 |
| 2015-01-22 | -0.033 |
| 2015-01-23 | -0.035 |
| 2015-01-26 | -0.008 |
| 2015-01-27 | -0.059 |
| 2015-01-28 | -0.106 |
| 2015-01-29 | -0.186 |
| 2015-01-30 | -0.271 |
| 2015-02-02 | -0.25 |
| 2015-02-03 | -0.152 |
| 2015-02-04 | -0.134 |
| 2015-02-05 | -0.104 |
| 2015-02-06 | -0.023 |
| 2015-02-09 | 0.002 |
| 2015-02-10 | -0.023 |
| 2015-02-11 | -0.058 |
| 2015-02-12 | -0.062 |
| 2015-02-13 | -0.096 |
| 2015-02-16 | -0.101 |
| 2015-02-17 | -0.132 |
| 2015-02-18 | -0.087 |
| 2015-02-19 | -0.047 |
| 2015-02-20 | -0.02 |
| 2015-02-23 | -0.022 |
| 2015-02-24 | -0.029 |
| 2015-02-25 | -0.078 |
| 2015-02-26 | -0.109 |
| 2015-02-27 | -0.111 |
| 2015-03-02 | -0.079 |
| 2015-03-03 | -0.068 |
| 2015-03-04 | -0.076 |
| 2015-03-05 | -0.089 |
| 2015-03-06 | -0.083 |
| 2015-03-09 | -0.087 |
| 2015-03-10 | -0.108 |
| 2015-03-11 | -0.061 |
| 2015-03-12 | -0.084 |
| 2015-03-13 | -0.071 |
| 2015-03-16 | -0.07 |
| 2015-03-17 | -0.114 |
| 2015-03-18 | -0.101 |
| 2015-03-19 | -0.078 |
| 2015-03-20 | -0.041 |
| 2015-03-23 | -0.059 |
| 2015-03-24 | -0.057 |
| 2015-03-25 | -0.094 |
| 2015-03-26 | -0.118 |
| 2015-03-27 | -0.115 |
| 2015-03-30 | -0.1 |
| 2015-03-31 | -0.115 |
| 2015-04-01 | -0.112 |
| 2015-04-02 | -0.085 |
| 2015-04-03 | -0.085 |
| 2015-04-06 | -0.119 |
| 2015-04-07 | -0.068 |
| 2015-04-08 | -0.067 |
| 2015-04-09 | -0.084 |
| 2015-04-10 | -0.088 |
| 2015-04-13 | -0.079 |
| 2015-04-14 | -0.067 |
| 2015-04-15 | -0.041 |
| 2015-04-16 | -0.029 |
| 2015-04-17 | -0.021 |
| 2015-04-20 | -0.013 |
| 2015-04-21 | -0.115 |
| 2015-04-22 | -0.128 |
| 2015-04-23 | -0.165 |
| 2015-04-24 | -0.131 |
| 2015-04-27 | -0.127 |
| 2015-04-28 | -0.128 |
| 2015-04-29 | -0.115 |
| 2015-04-30 | -0.095 |
| 2015-05-01 | -0.095 |
| 2015-05-04 | -0.117 |
| 2015-05-05 | -0.083 |
| 2015-05-06 | -0.071 |
| 2015-05-07 | -0.094 |
| 2015-05-08 | -0.044 |
| 2015-05-11 | -0.067 |
| 2015-05-12 | -0.189 |
| 2015-05-13 | -0.205 |
| 2015-05-14 | -0.217 |
| 2015-05-15 | -0.218 |
| 2015-05-18 | -0.197 |
| 2015-05-19 | -0.158 |
| 2015-05-20 | -0.131 |
| 2015-05-21 | -0.131 |
| 2015-05-22 | -0.138 |
| 2015-05-25 | -0.178 |
| 2015-05-26 | -0.209 |
| 2015-05-27 | -0.191 |
| 2015-05-28 | -0.157 |
| 2015-05-29 | -0.174 |
| 2015-06-01 | -0.159 |
| 2015-06-02 | -0.13 |
| 2015-06-03 | -0.165 |
| 2015-06-04 | -0.169 |
| 2015-06-05 | -0.184 |
| 2015-06-08 | -0.194 |
| 2015-06-09 | -0.224 |
| 2015-06-10 | -0.216 |
| 2015-06-11 | -0.226 |
| 2015-06-12 | -0.238 |
| 2015-06-15 | -0.274 |
| 2015-06-16 | -0.301 |
| 2015-06-17 | -0.303 |
| 2015-06-18 | -0.316 |
| 2015-06-19 | -0.279 |
| 2015-06-22 | -0.305 |
| 2015-06-23 | -0.289 |
| 2015-06-24 | -0.297 |
| 2015-06-25 | -0.24 |
| 2015-06-26 | -0.238 |
| 2015-06-29 | -0.238 |
| 2015-06-30 | -0.236 |
| 2015-07-01 | -0.19 |
| 2015-07-02 | -0.141 |
| 2015-07-03 | -0.112 |
| 2015-07-06 | -0.164 |
| 2015-07-07 | -0.184 |
| 2015-07-08 | -0.18 |
| 2015-07-09 | -0.186 |
| 2015-07-10 | -0.161 |
| 2015-07-13 | -0.218 |
| 2015-07-14 | -0.246 |
| 2015-07-15 | -0.247 |
| 2015-07-16 | -0.247 |
| 2015-07-17 | -0.254 |
| 2015-07-20 | -0.261 |
| 2015-07-21 | -0.205 |
| 2015-07-22 | -0.247 |
| 2015-07-23 | -0.246 |
| 2015-07-24 | -0.268 |
| 2015-07-27 | -0.314 |
| 2015-07-28 | -0.307 |
| 2015-07-29 | -0.329 |
| 2015-07-30 | -0.295 |
| 2015-07-31 | -0.341 |
| 2015-08-03 | -0.326 |
| 2015-08-04 | -0.32 |
| 2015-08-05 | -0.368 |
| 2015-08-06 | -0.407 |
| 2015-08-07 | -0.401 |
| 2015-08-10 | -0.378 |
| 2015-08-11 | -0.375 |
| 2015-08-12 | -0.381 |
| 2015-08-13 | -0.354 |
| 2015-08-14 | -0.334 |
| 2015-08-17 | -0.34 |
| 2015-08-18 | -0.318 |
| 2015-08-19 | -0.264 |
| 2015-08-20 | -0.282 |
| 2015-08-21 | -0.241 |
| 2015-08-24 | -0.237 |
| 2015-08-25 | -0.282 |
| 2015-08-26 | -0.249 |
| 2015-08-27 | -0.228 |
| 2015-08-28 | -0.205 |
| 2015-08-31 | -0.199 |
| 2015-09-01 | -0.18 |
| 2015-09-02 | -0.14 |
| 2015-09-03 | -0.194 |
| 2015-09-04 | -0.188 |
| 2015-09-07 | -0.171 |
| 2015-09-08 | -0.138 |
| 2015-09-09 | -0.138 |
| 2015-09-10 | -0.149 |
| 2015-09-11 | -0.104 |
| 2015-09-14 | -0.071 |
| 2015-09-15 | -0.105 |
| 2015-09-16 | -0.123 |
| 2015-09-17 | -0.121 |
| 2015-09-18 | -0.121 |
| 2015-09-21 | -0.157 |
| 2015-09-22 | -0.169 |
| 2015-09-23 | -0.147 |
| 2015-09-24 | -0.159 |
| 2015-09-25 | -0.115 |
| 2015-09-28 | -0.078 |
| 2015-09-29 | -0.104 |
| 2015-09-30 | -0.053 |
| 2015-10-01 | -0.079 |
| 2015-10-02 | -0.089 |
| 2015-10-05 | -0.088 |
| 2015-10-06 | -0.079 |
| 2015-10-07 | -0.122 |
| 2015-10-08 | -0.089 |
| 2015-10-09 | -0.124 |
| 2015-10-12 | -0.124 |
| 2015-10-13 | -0.104 |
| 2015-10-14 | -0.132 |
| 2015-10-15 | -0.175 |
| 2015-10-16 | -0.189 |
| 2015-10-19 | -0.199 |
| 2015-10-20 | -0.215 |
| 2015-10-21 | -0.181 |
| 2015-10-22 | -0.18 |
| 2015-10-23 | -0.2 |
| 2015-10-26 | -0.23 |
| 2015-10-27 | -0.284 |
| 2015-10-28 | -0.348 |
| 2015-10-29 | -0.315 |
| 2015-10-30 | -0.284 |
| 2015-11-02 | -0.206 |
| 2015-11-03 | -0.213 |
| 2015-11-04 | -0.184 |
| 2015-11-05 | -0.154 |
| 2015-11-06 | -0.117 |
| 2015-11-09 | -0.119 |
| 2015-11-10 | -0.09 |
| 2015-11-11 | -0.066 |
| 2015-11-12 | -0.073 |
| 2015-11-13 | -0.095 |
| 2015-11-16 | -0.11 |
| 2015-11-17 | -0.142 |
| 2015-11-18 | -0.124 |
| 2015-11-19 | -0.133 |
| 2015-11-20 | -0.153 |
| 2015-11-23 | -0.147 |
| 2015-11-24 | -0.15 |
| 2015-11-25 | -0.154 |
| 2015-11-26 | -0.131 |
| 2015-11-27 | -0.09 |
| 2015-11-30 | -0.138 |
| 2015-12-01 | -0.129 |
| 2015-12-02 | -0.102 |
| 2015-12-03 | -0.126 |
| 2015-12-04 | -0.132 |
| 2015-12-07 | -0.17 |
| 2015-12-08 | -0.17 |
| 2015-12-09 | -0.132 |
| 2015-12-10 | -0.127 |
| 2015-12-11 | -0.124 |
| 2015-12-14 | -0.117 |
| 2015-12-15 | -0.053 |
| 2015-12-16 | -0.055 |
| 2015-12-17 | -0.101 |
| 2015-12-18 | -0.13 |
| 2015-12-21 | -0.141 |
| 2015-12-22 | -0.151 |
| 2015-12-23 | -0.191 |
| 2015-12-24 | -0.136 |
| 2015-12-25 | -0.136 |
| 2015-12-28 | -0.142 |
| 2015-12-29 | -0.138 |
| 2015-12-30 | -0.143 |
| 2015-12-31 | -0.143 |
| 2016-01-01 | -0.143 |
| 2016-01-04 | -0.118 |
| 2016-01-05 | -0.092 |
| 2016-01-06 | -0.151 |
| 2016-01-07 | -0.156 |
| 2016-01-08 | -0.18 |
| 2016-01-11 | -0.188 |
| 2016-01-12 | -0.204 |
| 2016-01-13 | -0.183 |
| 2016-01-14 | -0.218 |
| 2016-01-15 | -0.211 |
| 2016-01-18 | -0.222 |
| 2016-01-19 | -0.19 |
| 2016-01-20 | -0.193 |
| 2016-01-21 | -0.161 |
| 2016-01-22 | -0.165 |
| 2016-01-25 | -0.144 |
| 2016-01-26 | -0.197 |
| 2016-01-27 | -0.193 |
| 2016-01-28 | -0.237 |
| 2016-01-29 | -0.275 |
| 2016-02-01 | -0.28 |
| 2016-02-02 | -0.274 |
| 2016-02-03 | -0.264 |
| 2016-02-04 | -0.244 |
| 2016-02-05 | -0.233 |
| 2016-02-08 | -0.2 |
| 2016-02-09 | -0.176 |
| 2016-02-10 | -0.182 |
| 2016-02-11 | -0.241 |
| 2016-02-12 | -0.241 |
| 2016-02-15 | -0.231 |
| 2016-02-16 | -0.219 |
| 2016-02-17 | -0.199 |
| 2016-02-18 | -0.227 |
| 2016-02-19 | -0.233 |
| 2016-02-22 | -0.244 |
| 2016-02-23 | -0.255 |
| 2016-02-24 | -0.273 |
| 2016-02-25 | -0.232 |
| 2016-02-26 | -0.224 |
| 2016-02-29 | -0.211 |
| 2016-03-01 | -0.194 |
| 2016-03-02 | -0.177 |
| 2016-03-03 | -0.177 |
| 2016-03-04 | -0.198 |
| 2016-03-07 | -0.207 |
| 2016-03-08 | -0.214 |
| 2016-03-09 | -0.181 |
| 2016-03-10 | -0.186 |
| 2016-03-11 | -0.167 |
| 2016-03-14 | -0.155 |
| 2016-03-15 | -0.145 |
| 2016-03-16 | -0.094 |
| 2016-03-17 | -0.085 |
| 2016-03-18 | -0.038 |
| 2016-03-21 | -0.026 |
| 2016-03-22 | -0.022 |
| 2016-03-23 | -0.041 |
| 2016-03-24 | -0.06 |
| 2016-03-25 | -0.06 |
| 2016-03-28 | -0.062 |
| 2016-03-29 | -0.075 |
| 2016-03-30 | -0.078 |
| 2016-03-31 | -0.038 |
| 2016-04-01 | -0.039 |
| 2016-04-04 | -0.025 |
| 2016-04-05 | -0.034 |
| 2016-04-06 | -0.011 |
| 2016-04-07 | 0.013 |
| 2016-04-08 | 0.018 |
| 2016-04-11 | -0.01 |
| 2016-04-12 | -0.033 |
| 2016-04-13 | -0.007 |
| 2016-04-14 | -0.057 |
| 2016-04-15 | -0.079 |
| 2016-04-18 | -0.098 |
| 2016-04-19 | -0.069 |
| 2016-04-20 | -0.066 |
| 2016-04-21 | -0.073 |
| 2016-04-22 | -0.121 |
| 2016-04-25 | -0.174 |
| 2016-04-26 | -0.2 |
| 2016-04-27 | -0.202 |
| 2016-04-28 | -0.19 |
| 2016-04-29 | -0.186 |
| 2016-05-02 | -0.201 |
| 2016-05-03 | -0.215 |
| 2016-05-04 | -0.204 |
| 2016-05-05 | -0.196 |
| 2016-05-06 | -0.198 |
| 2016-05-09 | -0.166 |
| 2016-05-10 | -0.174 |
| 2016-05-11 | -0.16 |
| 2016-05-12 | -0.177 |
| 2016-05-13 | -0.169 |
| 2016-05-16 | -0.144 |
| 2016-05-17 | -0.152 |
| 2016-05-18 | -0.147 |
| 2016-05-19 | -0.111 |
| 2016-05-20 | -0.104 |
| 2016-05-23 | -0.073 |
| 2016-05-24 | -0.079 |
| 2016-05-25 | -0.121 |
| 2016-05-26 | -0.159 |
| 2016-05-27 | -0.148 |
| 2016-05-30 | -0.156 |
| 2016-05-31 | -0.149 |
| 2016-06-01 | -0.137 |
| 2016-06-02 | -0.169 |
| 2016-06-03 | -0.173 |
| 2016-06-06 | -0.175 |
| 2016-06-07 | -0.134 |
| 2016-06-08 | -0.188 |
| 2016-06-09 | -0.196 |
| 2016-06-10 | -0.21 |
| 2016-06-13 | -0.202 |
| 2016-06-14 | -0.217 |
| 2016-06-15 | -0.206 |
| 2016-06-16 | -0.224 |
| 2016-06-17 | -0.227 |
| 2016-06-20 | -0.225 |
| 2016-06-21 | -0.175 |
| 2016-06-22 | -0.174 |
| 2016-06-23 | -0.15 |
| 2016-06-24 | -0.182 |
| 2016-06-27 | -0.182 |
| 2016-06-28 | -0.197 |
| 2016-06-29 | -0.185 |
| 2016-06-30 | -0.236 |
| 2016-07-01 | -0.25 |
| 2016-07-04 | -0.229 |
| 2016-07-05 | -0.224 |
| 2016-07-06 | -0.184 |
| 2016-07-07 | -0.191 |
| 2016-07-08 | -0.183 |
| 2016-07-11 | -0.173 |
| 2016-07-12 | -0.204 |
| 2016-07-13 | -0.211 |
| 2016-07-14 | -0.242 |
| 2016-07-15 | -0.269 |
| 2016-07-18 | -0.316 |
| 2016-07-19 | -0.327 |
| 2016-07-20 | -0.341 |
| 2016-07-21 | -0.313 |
| 2016-07-22 | -0.283 |
| 2016-07-25 | -0.247 |
| 2016-07-26 | -0.246 |
| 2016-07-27 | -0.234 |
| 2016-07-28 | -0.234 |
| 2016-07-29 | -0.256 |
| 2016-08-01 | -0.247 |
| 2016-08-02 | -0.268 |
| 2016-08-03 | -0.28 |
| 2016-08-04 | -0.236 |
| 2016-08-05 | -0.225 |
| 2016-08-08 | -0.248 |
| 2016-08-09 | -0.189 |
| 2016-08-10 | -0.151 |
| 2016-08-11 | -0.134 |
| 2016-08-12 | -0.192 |
| 2016-08-15 | -0.192 |
| 2016-08-16 | -0.197 |
| 2016-08-17 | -0.21 |
| 2016-08-18 | -0.233 |
| 2016-08-19 | -0.231 |
| 2016-08-22 | -0.23 |
| 2016-08-23 | -0.249 |
| 2016-08-24 | -0.205 |
| 2016-08-25 | -0.205 |
| 2016-08-26 | -0.216 |
| 2016-08-29 | -0.236 |
| 2016-08-30 | -0.24 |
| 2016-08-31 | -0.246 |
| 2016-09-01 | -0.224 |
| 2016-09-02 | -0.235 |
| 2016-09-05 | -0.214 |
| 2016-09-06 | -0.231 |
| 2016-09-07 | -0.225 |
| 2016-09-08 | -0.203 |
| 2016-09-09 | -0.166 |
| 2016-09-12 | -0.174 |
| 2016-09-13 | -0.138 |
| 2016-09-14 | -0.162 |
| 2016-09-15 | -0.204 |
| 2016-09-16 | -0.176 |
| 2016-09-19 | -0.176 |
| 2016-09-20 | -0.164 |
| 2016-09-21 | -0.186 |
| 2016-09-22 | -0.174 |
| 2016-09-23 | -0.181 |
| 2016-09-26 | -0.181 |
| 2016-09-27 | -0.167 |
| 2016-09-28 | -0.193 |
| 2016-09-29 | -0.194 |
| 2016-09-30 | -0.197 |
| 2016-10-03 | -0.163 |
| 2016-10-04 | -0.141 |
| 2016-10-05 | -0.163 |
| 2016-10-06 | -0.154 |
| 2016-10-07 | -0.193 |
| 2016-10-10 | -0.193 |
| 2016-10-11 | -0.235 |
| 2016-10-12 | -0.225 |
| 2016-10-13 | -0.254 |
| 2016-10-14 | -0.227 |
| 2016-10-17 | -0.227 |
| 2016-10-18 | -0.227 |
| 2016-10-19 | -0.243 |
| 2016-10-20 | -0.233 |
| 2016-10-21 | -0.257 |
| 2016-10-24 | -0.257 |
| 2016-10-25 | -0.226 |
| 2016-10-26 | -0.255 |
| 2016-10-27 | -0.256 |
| 2016-10-28 | -0.235 |
| 2016-10-31 | -0.235 |
| 2016-11-01 | -0.235 |
| 2016-11-02 | -0.23 |
| 2016-11-03 | -0.248 |
| 2016-11-04 | -0.213 |
| 2016-11-07 | -0.219 |
| 2016-11-08 | -0.257 |
| 2016-11-09 | -0.216 |
| 2016-11-10 | -0.216 |
| 2016-11-11 | -0.161 |
| 2016-11-14 | -0.193 |
| 2016-11-15 | -0.202 |
| 2016-11-16 | -0.178 |
| 2016-11-17 | -0.184 |
| 2016-11-18 | -0.149 |
| 2016-11-21 | -0.148 |
| 2016-11-22 | -0.234 |
| 2016-11-23 | -0.236 |
| 2016-11-24 | -0.2 |
| 2016-11-25 | -0.176 |
| 2016-11-28 | -0.176 |
| 2016-11-29 | -0.233 |
| 2016-11-30 | -0.215 |
| 2016-12-01 | -0.153 |
| 2016-12-02 | -0.155 |
| 2016-12-05 | -0.178 |
| 2016-12-06 | -0.234 |
| 2016-12-07 | -0.262 |
| 2016-12-08 | -0.262 |
| 2016-12-09 | -0.262 |
| 2016-12-12 | -0.292 |
| 2016-12-13 | -0.292 |
| 2016-12-14 | -0.275 |
| 2016-12-15 | -0.238 |
| 2016-12-16 | -0.236 |
| 2016-12-19 | -0.238 |
| 2016-12-20 | -0.223 |
| 2016-12-21 | -0.298 |
| 2016-12-22 | -0.284 |
| 2016-12-23 | -0.258 |
| 2016-12-26 | -0.276 |
| 2016-12-27 | -0.275 |
| 2016-12-28 | -0.292 |
| 2016-12-29 | -0.282 |
| 2016-12-30 | -0.28 |
| 2017-01-02 | -0.28 |
| 2017-01-03 | -0.263 |
| 2017-01-04 | -0.244 |
| 2017-01-05 | -0.195 |
| 2017-01-06 | -0.192 |
| 2017-01-09 | -0.157 |
| 2017-01-10 | -0.158 |
| 2017-01-11 | -0.158 |
| 2017-01-12 | -0.161 |
| 2017-01-13 | -0.145 |
| 2017-01-16 | -0.171 |
| 2017-01-17 | -0.175 |
| 2017-01-18 | -0.175 |
| 2017-01-19 | -0.162 |
| 2017-01-20 | -0.178 |
| 2017-01-23 | -0.172 |
| 2017-01-24 | -0.165 |
| 2017-01-25 | -0.125 |
| 2017-01-26 | -0.135 |
| 2017-01-27 | -0.124 |
| 2017-01-30 | -0.149 |
| 2017-01-31 | -0.191 |
| 2017-02-01 | -0.198 |
| 2017-02-02 | -0.225 |
| 2017-02-03 | -0.181 |
| 2017-02-06 | -0.169 |
| 2017-02-07 | -0.134 |
| 2017-02-08 | -0.159 |
| 2017-02-09 | -0.165 |
| 2017-02-10 | -0.163 |
| 2017-02-13 | -0.165 |
| 2017-02-14 | -0.158 |
| 2017-02-15 | -0.154 |
| 2017-02-16 | -0.156 |
| 2017-02-17 | -0.171 |
| 2017-02-20 | -0.17 |
| 2017-02-21 | -0.19 |
| 2017-02-22 | -0.183 |
| 2017-02-23 | -0.21 |
| 2017-02-24 | -0.244 |
| 2017-02-27 | -0.242 |
| 2017-02-28 | -0.195 |
| 2017-03-01 | -0.174 |
| 2017-03-02 | -0.165 |
| 2017-03-03 | -0.175 |
| 2017-03-06 | -0.125 |
| 2017-03-07 | -0.148 |
| 2017-03-08 | -0.149 |
| 2017-03-09 | -0.136 |
| 2017-03-10 | -0.118 |
| 2017-03-13 | -0.098 |
| 2017-03-14 | -0.155 |
| 2017-03-15 | -0.17 |
| 2017-03-16 | -0.19 |
| 2017-03-17 | -0.168 |
| 2017-03-20 | -0.188 |
| 2017-03-21 | -0.215 |
| 2017-03-22 | -0.257 |
| 2017-03-23 | -0.241 |
| 2017-03-24 | -0.231 |
| 2017-03-27 | -0.245 |
| 2017-03-28 | -0.253 |
| 2017-03-29 | -0.253 |
| 2017-03-30 | -0.242 |
| 2017-03-31 | -0.185 |
| 2017-04-03 | -0.173 |
| 2017-04-04 | -0.201 |
| 2017-04-05 | -0.203 |
| 2017-04-06 | -0.191 |
| 2017-04-07 | -0.178 |
| 2017-04-10 | -0.176 |
| 2017-04-11 | -0.229 |
| 2017-04-12 | -0.251 |
| 2017-04-13 | -0.262 |
| 2017-04-14 | -0.262 |
| 2017-04-17 | -0.223 |
| 2017-04-18 | -0.23 |
| 2017-04-19 | -0.23 |
| 2017-04-20 | -0.212 |
| 2017-04-21 | -0.224 |
| 2017-04-24 | -0.241 |
| 2017-04-25 | -0.228 |
| 2017-04-26 | -0.184 |
| 2017-04-27 | -0.207 |
| 2017-04-28 | -0.184 |
| 2017-05-01 | -0.184 |
| 2017-05-02 | -0.195 |
| 2017-05-03 | -0.17 |
| 2017-05-04 | -0.169 |
| 2017-05-05 | -0.139 |
| 2017-05-08 | -0.126 |
| 2017-05-09 | -0.125 |
| 2017-05-10 | -0.141 |
| 2017-05-11 | -0.104 |
| 2017-05-12 | -0.098 |
| 2017-05-15 | -0.102 |
| 2017-05-16 | -0.108 |
| 2017-05-17 | -0.13 |
| 2017-05-18 | -0.142 |
| 2017-05-19 | -0.136 |
| 2017-05-22 | -0.121 |
| 2017-05-23 | -0.144 |
| 2017-05-24 | -0.112 |
| 2017-05-25 | -0.129 |
| 2017-05-26 | -0.119 |
| 2017-05-29 | -0.124 |
| 2017-05-30 | -0.123 |
| 2017-05-31 | -0.163 |
| 2017-06-01 | -0.188 |
| 2017-06-02 | -0.239 |
| 2017-06-05 | -0.222 |
| 2017-06-06 | -0.233 |
| 2017-06-07 | -0.216 |
| 2017-06-08 | -0.191 |
| 2017-06-09 | -0.19 |
| 2017-06-12 | -0.183 |
| 2017-06-13 | -0.194 |
| 2017-06-14 | -0.239 |
| 2017-06-15 | -0.204 |
| 2017-06-16 | -0.218 |
| 2017-06-19 | -0.221 |
| 2017-06-20 | -0.272 |
| 2017-06-21 | -0.275 |
| 2017-06-22 | -0.259 |
| 2017-06-23 | -0.272 |
| 2017-06-26 | -0.272 |
| 2017-06-27 | -0.272 |
| 2017-06-28 | -0.272 |
| 2017-06-29 | -0.246 |
| 2017-06-30 | -0.23 |
| 2017-07-03 | -0.23 |
| 2017-07-04 | -0.227 |
| 2017-07-05 | -0.226 |
| 2017-07-06 | -0.265 |
| 2017-07-07 | -0.287 |
| 2017-07-10 | -0.301 |
| 2017-07-11 | -0.307 |
| 2017-07-12 | -0.28 |
| 2017-07-13 | -0.295 |
| 2017-07-14 | -0.284 |
| 2017-07-17 | -0.309 |
| 2017-07-18 | -0.293 |
| 2017-07-19 | -0.283 |
| 2017-07-20 | -0.301 |
| 2017-07-21 | -0.31 |
| 2017-07-24 | -0.325 |
| 2017-07-25 | -0.317 |
| 2017-07-26 | -0.286 |
| 2017-07-27 | -0.25 |
| 2017-07-28 | -0.231 |
| 2017-07-31 | -0.209 |
| 2017-08-01 | -0.228 |
| 2017-08-02 | -0.242 |
| 2017-08-03 | -0.254 |
| 2017-08-04 | -0.262 |
| 2017-08-07 | -0.272 |
| 2017-08-08 | -0.238 |
| 2017-08-09 | -0.262 |
| 2017-08-10 | -0.278 |
| 2017-08-11 | -0.266 |
| 2017-08-14 | -0.289 |
| 2017-08-15 | -0.289 |
| 2017-08-16 | -0.282 |
| 2017-08-17 | -0.302 |
| 2017-08-18 | -0.277 |
| 2017-08-21 | -0.299 |
| 2017-08-22 | -0.302 |
| 2017-08-23 | -0.27 |
| 2017-08-24 | -0.228 |
| 2017-08-25 | -0.24 |
| 2017-08-28 | -0.24 |
| 2017-08-29 | -0.247 |
| 2017-08-30 | -0.229 |
| 2017-08-31 | -0.225 |
| 2017-09-01 | -0.219 |
| 2017-09-04 | -0.21 |
| 2017-09-05 | -0.21 |
| 2017-09-06 | -0.217 |
| 2017-09-07 | -0.271 |
| 2017-09-08 | -0.266 |
| 2017-09-11 | -0.246 |
| 2017-09-12 | -0.213 |
| 2017-09-13 | -0.208 |
| 2017-09-14 | -0.207 |
| 2017-09-15 | -0.179 |
| 2017-09-18 | -0.179 |
| 2017-09-19 | -0.179 |
| 2017-09-20 | -0.202 |
| 2017-09-21 | -0.193 |
| 2017-09-22 | -0.183 |
| 2017-09-25 | -0.199 |
| 2017-09-26 | -0.193 |
| 2017-09-27 | -0.2 |
| 2017-09-28 | -0.205 |
| 2017-09-29 | -0.181 |
| 2017-10-02 | -0.201 |
| 2017-10-03 | -0.213 |
| 2017-10-04 | -0.194 |
| 2017-10-05 | -0.189 |
| 2017-10-06 | -0.212 |
| 2017-10-09 | -0.212 |
| 2017-10-10 | -0.253 |
| 2017-10-11 | -0.259 |
| 2017-10-12 | -0.264 |
| 2017-10-13 | -0.296 |
| 2017-10-16 | -0.315 |
| 2017-10-17 | -0.295 |
| 2017-10-18 | -0.286 |
| 2017-10-19 | -0.28 |
| 2017-10-20 | -0.242 |
| 2017-10-23 | -0.259 |
| 2017-10-24 | -0.258 |
| 2017-10-25 | -0.268 |
| 2017-10-26 | -0.284 |
| 2017-10-27 | -0.284 |
| 2017-10-30 | -0.332 |
| 2017-10-31 | -0.341 |
| 2017-11-01 | -0.341 |
| 2017-11-02 | -0.325 |
| 2017-11-03 | -0.314 |
| 2017-11-06 | -0.294 |
| 2017-11-07 | -0.287 |
| 2017-11-08 | -0.252 |
| 2017-11-09 | -0.272 |
| 2017-11-10 | -0.302 |
| 2017-11-13 | -0.326 |
| 2017-11-14 | -0.305 |
| 2017-11-15 | -0.315 |
| 2017-11-16 | -0.314 |
| 2017-11-17 | -0.28 |
| 2017-11-20 | -0.283 |
| 2017-11-21 | -0.299 |
| 2017-11-22 | -0.297 |
| 2017-11-23 | -0.311 |
| 2017-11-24 | -0.301 |
| 2017-11-27 | -0.314 |
| 2017-11-28 | -0.318 |
| 2017-11-29 | -0.317 |
| 2017-11-30 | -0.34 |
| 2017-12-01 | -0.363 |
| 2017-12-04 | -0.342 |
| 2017-12-05 | -0.338 |
| 2017-12-06 | -0.306 |
| 2017-12-07 | -0.307 |
| 2017-12-08 | -0.307 |
| 2017-12-11 | -0.282 |
| 2017-12-12 | -0.305 |
| 2017-12-13 | -0.325 |
| 2017-12-14 | -0.377 |
| 2017-12-15 | -0.397 |
| 2017-12-18 | -0.399 |
| 2017-12-19 | -0.387 |
| 2017-12-20 | -0.352 |
| 2017-12-21 | -0.348 |
| 2017-12-22 | -0.333 |
| 2017-12-25 | -0.333 |
| 2017-12-26 | -0.345 |
| 2017-12-27 | -0.361 |
| 2017-12-28 | -0.345 |
| 2017-12-29 | -0.365 |
| 2018-01-01 | -0.365 |
| 2018-01-02 | -0.372 |
| 2018-01-03 | -0.35 |
| 2018-01-04 | -0.305 |
| 2018-01-05 | -0.283 |
| 2018-01-08 | -0.308 |
| 2018-01-09 | -0.34 |
| 2018-01-10 | -0.345 |
| 2018-01-11 | -0.34 |
| 2018-01-12 | -0.355 |
| 2018-01-15 | -0.363 |
| 2018-01-16 | -0.363 |
| 2018-01-17 | -0.408 |
| 2018-01-18 | -0.397 |
| 2018-01-19 | -0.406 |
| 2018-01-22 | -0.432 |
| 2018-01-23 | -0.426 |
| 2018-01-24 | -0.439 |
| 2018-01-25 | -0.436 |
| 2018-01-26 | -0.442 |
| 2018-01-29 | -0.416 |
| 2018-01-30 | -0.422 |
| 2018-01-31 | -0.403 |
| 2018-02-01 | -0.349 |
| 2018-02-02 | -0.331 |
| 2018-02-05 | -0.331 |
| 2018-02-06 | -0.329 |
| 2018-02-07 | -0.341 |
| 2018-02-08 | -0.319 |
| 2018-02-09 | -0.28 |
| 2018-02-12 | -0.271 |
| 2018-02-13 | -0.309 |
| 2018-02-14 | -0.296 |
| 2018-02-15 | -0.282 |
| 2018-02-16 | -0.291 |
| 2018-02-19 | -0.297 |
| 2018-02-20 | -0.301 |
| 2018-02-21 | -0.294 |
| 2018-02-22 | -0.36 |
| 2018-02-23 | -0.347 |
| 2018-02-26 | -0.356 |
| 2018-02-27 | -0.356 |
| 2018-02-28 | -0.34 |
| 2018-03-01 | -0.323 |
| 2018-03-02 | -0.312 |
| 2018-03-05 | -0.278 |
| 2018-03-06 | -0.272 |
| 2018-03-07 | -0.274 |
| 2018-03-08 | -0.282 |
| 2018-03-09 | -0.295 |
| 2018-03-12 | -0.289 |
| 2018-03-13 | -0.291 |
| 2018-03-14 | -0.297 |
| 2018-03-15 | -0.285 |
| 2018-03-16 | -0.293 |
| 2018-03-19 | -0.307 |
| 2018-03-20 | -0.33 |
| 2018-03-21 | -0.335 |
| 2018-03-22 | -0.337 |
| 2018-03-23 | -0.302 |
| 2018-03-26 | -0.312 |
| 2018-03-27 | -0.294 |
| 2018-03-28 | -0.279 |
| 2018-03-29 | -0.265 |
| 2018-03-30 | -0.265 |
| 2018-04-02 | -0.238 |
| 2018-04-03 | -0.274 |
| 2018-04-04 | -0.283 |
| 2018-04-05 | -0.267 |
| 2018-04-06 | -0.279 |
| 2018-04-09 | -0.316 |
| 2018-04-10 | -0.305 |
| 2018-04-11 | -0.322 |
| 2018-04-12 | -0.33 |
| 2018-04-13 | -0.319 |
| 2018-04-16 | -0.359 |
| 2018-04-17 | -0.374 |
| 2018-04-18 | -0.348 |
| 2018-04-19 | -0.35 |
| 2018-04-20 | -0.337 |
| 2018-04-23 | -0.325 |
| 2018-04-24 | -0.338 |
| 2018-04-25 | -0.314 |
| 2018-04-26 | -0.326 |
| 2018-04-27 | -0.312 |
| 2018-04-30 | -0.345 |
| 2018-05-01 | -0.345 |
| 2018-05-02 | -0.34 |
| 2018-05-03 | -0.33 |
| 2018-05-04 | -0.326 |
| 2018-05-07 | -0.304 |
| 2018-05-08 | -0.293 |
| 2018-05-09 | -0.288 |
| 2018-05-10 | -0.335 |
| 2018-05-11 | -0.323 |
| 2018-05-14 | -0.33 |
| 2018-05-15 | -0.338 |
| 2018-05-16 | -0.32 |
| 2018-05-17 | -0.315 |
| 2018-05-18 | -0.314 |
| 2018-05-21 | -0.316 |
| 2018-05-22 | -0.307 |
| 2018-05-23 | -0.314 |
| 2018-05-24 | -0.3 |
| 2018-05-25 | -0.308 |
| 2018-05-28 | -0.291 |
| 2018-05-29 | -0.254 |
| 2018-05-30 | -0.247 |
| 2018-05-31 | -0.233 |
| 2018-06-01 | -0.229 |
| 2018-06-04 | -0.234 |
| 2018-06-05 | -0.234 |
| 2018-06-06 | -0.235 |
| 2018-06-07 | -0.248 |
| 2018-06-08 | -0.255 |
| 2018-06-11 | -0.248 |
| 2018-06-12 | -0.265 |
| 2018-06-13 | -0.297 |
| 2018-06-14 | -0.278 |
| 2018-06-15 | -0.271 |
| 2018-06-18 | -0.251 |
| 2018-06-19 | -0.28 |
| 2018-06-20 | -0.292 |
| 2018-06-21 | -0.26 |
| 2018-06-22 | -0.27 |
| 2018-06-25 | -0.268 |
| 2018-06-26 | -0.284 |
| 2018-06-27 | -0.282 |
| 2018-06-28 | -0.264 |
| 2018-06-29 | -0.261 |
| 2018-07-02 | -0.262 |
| 2018-07-03 | -0.257 |
| 2018-07-04 | -0.248 |
| 2018-07-05 | -0.265 |
| 2018-07-06 | -0.278 |
| 2018-07-09 | -0.274 |
| 2018-07-10 | -0.24 |
| 2018-07-11 | -0.227 |
| 2018-07-12 | -0.235 |
| 2018-07-13 | -0.238 |
| 2018-07-16 | -0.238 |
| 2018-07-17 | -0.251 |
| 2018-07-18 | -0.258 |
| 2018-07-19 | -0.263 |
| 2018-07-20 | -0.229 |
| 2018-07-23 | -0.199 |
| 2018-07-24 | -0.222 |
| 2018-07-25 | -0.232 |
| 2018-07-26 | -0.237 |
| 2018-07-27 | -0.216 |
| 2018-07-30 | -0.214 |
| 2018-07-31 | -0.21 |
| 2018-08-01 | -0.223 |
| 2018-08-02 | -0.22 |
| 2018-08-03 | -0.235 |
| 2018-08-06 | -0.219 |
| 2018-08-07 | -0.208 |
| 2018-08-08 | -0.223 |
| 2018-08-09 | -0.233 |
| 2018-08-10 | -0.219 |
| 2018-08-13 | -0.217 |
| 2018-08-14 | -0.195 |
| 2018-08-15 | -0.196 |
| 2018-08-16 | -0.198 |
| 2018-08-17 | -0.213 |
| 2018-08-20 | -0.241 |
| 2018-08-21 | -0.246 |
| 2018-08-22 | -0.252 |
| 2018-08-23 | -0.241 |
| 2018-08-24 | -0.222 |
| 2018-08-27 | -0.233 |
| 2018-08-28 | -0.254 |
| 2018-08-29 | -0.225 |
| 2018-08-30 | -0.197 |
| 2018-08-31 | -0.201 |
| 2018-09-03 | -0.207 |
| 2018-09-04 | -0.169 |
| 2018-09-05 | -0.152 |
| 2018-09-06 | -0.123 |
| 2018-09-07 | -0.124 |
| 2018-09-10 | -0.123 |
| 2018-09-11 | -0.138 |
| 2018-09-12 | -0.121 |
| 2018-09-13 | -0.123 |
| 2018-09-14 | -0.133 |
| 2018-09-17 | -0.135 |
| 2018-09-18 | -0.136 |
| 2018-09-19 | -0.136 |
| 2018-09-20 | -0.136 |
| 2018-09-21 | -0.165 |
| 2018-09-24 | -0.178 |
| 2018-09-25 | -0.184 |
| 2018-09-26 | -0.159 |
| 2018-09-27 | -0.148 |
| 2018-09-28 | -0.155 |
| 2018-10-01 | -0.138 |
| 2018-10-02 | -0.176 |
| 2018-10-03 | -0.182 |
| 2018-10-04 | -0.176 |
| 2018-10-05 | -0.191 |
| 2018-10-08 | -0.161 |
| 2018-10-09 | -0.135 |
| 2018-10-10 | -0.149 |
| 2018-10-11 | -0.156 |
| 2018-10-12 | -0.211 |
| 2018-10-15 | -0.213 |
| 2018-10-16 | -0.219 |
| 2018-10-17 | -0.207 |
| 2018-10-18 | -0.198 |
| 2018-10-19 | -0.183 |
| 2018-10-22 | -0.188 |
| 2018-10-23 | -0.167 |
| 2018-10-24 | -0.176 |
| 2018-10-25 | -0.162 |
| 2018-10-26 | -0.162 |
| 2018-10-29 | -0.166 |
| 2018-10-30 | -0.158 |
| 2018-10-31 | -0.172 |
| 2018-11-01 | -0.173 |
| 2018-11-02 | -0.174 |
| 2018-11-05 | -0.152 |
| 2018-11-06 | -0.168 |
| 2018-11-07 | -0.173 |
| 2018-11-08 | -0.151 |
| 2018-11-09 | -0.156 |
| 2018-11-12 | -0.158 |
| 2018-11-13 | -0.166 |
| 2018-11-14 | -0.183 |
| 2018-11-15 | -0.179 |
| 2018-11-16 | -0.194 |
| 2018-11-19 | -0.196 |
| 2018-11-20 | -0.214 |
| 2018-11-21 | -0.21 |
| 2018-11-22 | -0.204 |
| 2018-11-23 | -0.209 |
| 2018-11-26 | -0.198 |
| 2018-11-27 | -0.247 |
| 2018-11-28 | -0.278 |
| 2018-11-29 | -0.279 |
| 2018-11-30 | -0.279 |
| 2018-12-03 | -0.242 |
| 2018-12-04 | -0.26 |
| 2018-12-05 | -0.237 |
| 2018-12-06 | -0.242 |
| 2018-12-07 | -0.231 |
| 2018-12-10 | -0.208 |
| 2018-12-11 | -0.21 |
| 2018-12-12 | -0.21 |
| 2018-12-13 | -0.275 |
| 2018-12-14 | -0.321 |
| 2018-12-17 | -0.295 |
| 2018-12-18 | -0.317 |
| 2018-12-19 | -0.28 |
| 2018-12-20 | -0.304 |
| 2018-12-21 | -0.303 |
| 2018-12-24 | -0.303 |
| 2018-12-25 | -0.303 |
| 2018-12-26 | -0.316 |
| 2018-12-27 | -0.302 |
| 2018-12-28 | -0.299 |
| 2018-12-31 | -0.301 |
| 2019-01-01 | -0.302 |
| 2019-01-02 | -0.304 |
| 2019-01-03 | -0.269 |
| 2019-01-04 | -0.282 |
| 2019-01-07 | -0.276 |
| 2019-01-08 | -0.262 |
| 2019-01-09 | -0.243 |
| 2019-01-10 | -0.223 |
| 2019-01-11 | -0.2 |
| 2019-01-14 | -0.198 |
| 2019-01-15 | -0.176 |
| 2019-01-16 | -0.16 |
| 2019-01-17 | -0.145 |
| 2019-01-18 | -0.159 |
| 2019-01-21 | -0.183 |
| 2019-01-22 | -0.256 |
| 2019-01-23 | -0.255 |
| 2019-01-24 | -0.251 |
| 2019-01-25 | -0.228 |
| 2019-01-28 | -0.204 |
| 2019-01-29 | -0.203 |
| 2019-01-30 | -0.209 |
| 2019-01-31 | -0.221 |
| 2019-02-01 | -0.215 |
| 2019-02-04 | -0.178 |
| 2019-02-05 | -0.165 |
| 2019-02-06 | -0.198 |
| 2019-02-07 | -0.213 |
| 2019-02-08 | -0.276 |
| 2019-02-11 | -0.299 |
| 2019-02-12 | -0.304 |
| 2019-02-13 | -0.34 |
| 2019-02-14 | -0.336 |
| 2019-02-15 | -0.338 |
| 2019-02-18 | -0.324 |
| 2019-02-19 | -0.316 |
| 2019-02-20 | -0.317 |
| 2019-02-21 | -0.293 |
| 2019-02-22 | -0.29 |
| 2019-02-25 | -0.27 |
| 2019-02-26 | -0.26 |
| 2019-02-27 | -0.26 |
| 2019-02-28 | -0.23 |
| 2019-03-01 | -0.24 |
| 2019-03-04 | -0.249 |
| 2019-03-05 | -0.258 |
| 2019-03-06 | -0.279 |
| 2019-03-07 | -0.306 |
| 2019-03-08 | -0.329 |
| 2019-03-11 | -0.317 |
| 2019-03-12 | -0.327 |
| 2019-03-13 | -0.338 |
| 2019-03-14 | -0.335 |
| 2019-03-15 | -0.333 |
| 2019-03-18 | -0.329 |
| 2019-03-19 | -0.341 |
| 2019-03-20 | -0.332 |
| 2019-03-21 | -0.322 |
| 2019-03-22 | -0.317 |
| 2019-03-25 | -0.274 |
| 2019-03-26 | -0.301 |
| 2019-03-27 | -0.318 |
| 2019-03-28 | -0.326 |
| 2019-03-29 | -0.334 |
| 2019-04-01 | -0.345 |
| 2019-04-02 | -0.346 |
| 2019-04-03 | -0.35 |
| 2019-04-04 | -0.34 |
| 2019-04-05 | -0.335 |
| 2019-04-08 | -0.286 |
| 2019-04-09 | -0.303 |
| 2019-04-10 | -0.299 |
| 2019-04-11 | -0.297 |
| 2019-04-12 | -0.278 |
| 2019-04-15 | -0.303 |
| 2019-04-16 | -0.302 |
| 2019-04-17 | -0.308 |
| 2019-04-18 | -0.295 |
| 2019-04-19 | -0.295 |
| 2019-04-22 | -0.292 |
| 2019-04-23 | -0.296 |
| 2019-04-24 | -0.301 |
| 2019-04-25 | -0.318 |
| 2019-04-26 | -0.31 |
| 2019-04-29 | -0.323 |
| 2019-04-30 | -0.333 |
| 2019-05-01 | -0.333 |
| 2019-05-02 | -0.319 |
| 2019-05-03 | -0.318 |
| 2019-05-06 | -0.329 |
| 2019-05-07 | -0.319 |
| 2019-05-08 | -0.33 |
| 2019-05-09 | -0.332 |
| 2019-05-10 | -0.326 |
| 2019-05-13 | -0.346 |
| 2019-05-14 | -0.349 |
| 2019-05-15 | -0.333 |
| 2019-05-16 | -0.34 |
| 2019-05-17 | -0.348 |
| 2019-05-20 | -0.353 |
| 2019-05-21 | -0.354 |
| 2019-05-22 | -0.355 |
| 2019-05-23 | -0.355 |
| 2019-05-24 | -0.381 |
| 2019-05-27 | -0.348 |
| 2019-05-28 | -0.377 |
| 2019-05-29 | -0.435 |
| 2019-05-30 | -0.422 |
| 2019-05-31 | -0.429 |
| 2019-06-03 | -0.41 |
| 2019-06-04 | -0.358 |
| 2019-06-05 | -0.343 |
| 2019-06-06 | -0.315 |
| 2019-06-07 | -0.31 |
| 2019-06-10 | -0.343 |
| 2019-06-11 | -0.342 |
| 2019-06-12 | -0.344 |
| 2019-06-13 | -0.339 |
| 2019-06-14 | -0.344 |
| 2019-06-17 | -0.353 |
| 2019-06-18 | -0.372 |
| 2019-06-19 | -0.387 |
| 2019-06-20 | -0.425 |
| 2019-06-21 | -0.425 |
| 2019-06-24 | -0.451 |
| 2019-06-25 | -0.487 |
| 2019-06-26 | -0.465 |
| 2019-06-27 | -0.455 |
| 2019-06-28 | -0.442 |
| 2019-07-01 | -0.452 |
| 2019-07-02 | -0.44 |
| 2019-07-03 | -0.46 |
| 2019-07-04 | -0.461 |
| 2019-07-05 | -0.459 |
| 2019-07-08 | -0.466 |
| 2019-07-09 | -0.479 |
| 2019-07-10 | -0.474 |
| 2019-07-11 | -0.458 |
| 2019-07-12 | -0.451 |
| 2019-07-15 | -0.442 |
| 2019-07-16 | -0.442 |
| 2019-07-17 | -0.449 |
| 2019-07-18 | -0.458 |
| 2019-07-19 | -0.451 |
| 2019-07-22 | -0.461 |
| 2019-07-23 | -0.47 |
| 2019-07-24 | -0.477 |
| 2019-07-25 | -0.526 |
| 2019-07-26 | -0.511 |
| 2019-07-29 | -0.481 |
| 2019-07-30 | -0.448 |
| 2019-07-31 | -0.433 |
| 2019-08-01 | -0.442 |
| 2019-08-02 | -0.446 |
| 2019-08-05 | -0.452 |
| 2019-08-06 | -0.46 |
| 2019-08-07 | -0.476 |
| 2019-08-08 | -0.47 |
| 2019-08-09 | -0.453 |
| 2019-08-12 | -0.451 |
| 2019-08-13 | -0.46 |
| 2019-08-14 | -0.484 |
| 2019-08-15 | -0.484 |
| 2019-08-16 | -0.476 |
| 2019-08-19 | -0.469 |
| 2019-08-20 | -0.462 |
| 2019-08-21 | -0.467 |
| 2019-08-22 | -0.48 |
| 2019-08-23 | -0.494 |
| 2019-08-26 | -0.49 |
| 2019-08-27 | -0.501 |
| 2019-08-28 | -0.5 |
| 2019-08-29 | -0.493 |
| 2019-08-30 | -0.478 |
| 2019-09-02 | -0.475 |
| 2019-09-03 | -0.489 |
| 2019-09-04 | -0.449 |
| 2019-09-05 | -0.448 |
| 2019-09-06 | -0.45 |
| 2019-09-09 | -0.481 |
| 2019-09-10 | -0.495 |
| 2019-09-11 | -0.495 |
| 2019-09-12 | -0.474 |
| 2019-09-13 | -0.442 |
| 2019-09-16 | -0.427 |
| 2019-09-17 | -0.415 |
| 2019-09-18 | -0.415 |
| 2019-09-19 | -0.415 |
| 2019-09-20 | -0.415 |
| 2019-09-23 | -0.417 |
| 2019-09-24 | -0.405 |
| 2019-09-25 | -0.401 |
| 2019-09-26 | -0.378 |
| 2019-09-27 | -0.356 |
| 2019-09-30 | -0.33 |
| 2019-10-01 | -0.322 |
| 2019-10-02 | -0.327 |
| 2019-10-03 | -0.333 |
| 2019-10-04 | -0.329 |
| 2019-10-07 | -0.304 |
| 2019-10-08 | -0.357 |
| 2019-10-09 | -0.343 |
| 2019-10-10 | -0.322 |
| 2019-10-11 | -0.282 |
| 2019-10-14 | -0.271 |
| 2019-10-15 | -0.272 |
| 2019-10-16 | -0.303 |
| 2019-10-17 | -0.288 |
| 2019-10-18 | -0.269 |
| 2019-10-21 | -0.298 |
| 2019-10-22 | -0.322 |
| 2019-10-23 | -0.371 |
| 2019-10-24 | -0.356 |
| 2019-10-25 | -0.343 |
| 2019-10-28 | -0.309 |
| 2019-10-29 | -0.27 |
| 2019-10-30 | -0.246 |
| 2019-10-31 | -0.246 |
| 2019-11-01 | -0.246 |
| 2019-11-04 | -0.26 |
| 2019-11-05 | -0.258 |
| 2019-11-06 | -0.295 |
| 2019-11-07 | -0.261 |
| 2019-11-08 | -0.264 |
| 2019-11-11 | -0.299 |
| 2019-11-12 | -0.265 |
| 2019-11-13 | -0.207 |
| 2019-11-14 | -0.208 |
| 2019-11-15 | -0.268 |
| 2019-11-18 | -0.288 |
| 2019-11-19 | -0.278 |
| 2019-11-20 | -0.284 |
| 2019-11-21 | -0.294 |
| 2019-11-22 | -0.287 |
| 2019-11-25 | -0.279 |
| 2019-11-26 | -0.254 |
| 2019-11-27 | -0.224 |
| 2019-11-28 | -0.179 |
| 2019-11-29 | -0.138 |
| 2019-12-02 | -0.156 |
| 2019-12-03 | -0.147 |
| 2019-12-04 | -0.113 |
| 2019-12-05 | -0.128 |
| 2019-12-06 | -0.126 |
| 2019-12-09 | -0.132 |
| 2019-12-10 | -0.11 |
| 2019-12-11 | -0.096 |
| 2019-12-12 | -0.15 |
| 2019-12-13 | -0.132 |
| 2019-12-16 | -0.182 |
| 2019-12-17 | -0.211 |
| 2019-12-18 | -0.196 |
| 2019-12-19 | -0.251 |
| 2019-12-20 | -0.257 |
| 2019-12-23 | -0.259 |
| 2019-12-24 | -0.253 |
| 2019-12-25 | -0.253 |
| 2019-12-26 | -0.254 |
| 2019-12-27 | -0.256 |
| 2019-12-30 | -0.25 |
| 2019-12-31 | -0.251 |
| 2020-01-01 | -0.253 |
| 2020-01-02 | -0.24 |
| 2020-01-03 | -0.253 |
| 2020-01-06 | -0.198 |
| 2020-01-07 | -0.201 |
| 2020-01-08 | -0.225 |
| 2020-01-09 | -0.23 |
| 2020-01-10 | -0.21 |
| 2020-01-13 | -0.233 |
| 2020-01-14 | -0.249 |
| 2020-01-15 | -0.265 |
| 2020-01-16 | -0.296 |
| 2020-01-17 | -0.296 |
| 2020-01-20 | -0.26 |
| 2020-01-21 | -0.277 |
| 2020-01-22 | -0.25 |
| 2020-01-23 | -0.217 |
| 2020-01-24 | -0.193 |
| 2020-01-27 | -0.188 |
| 2020-01-28 | -0.17 |
| 2020-01-29 | -0.17 |
| 2020-01-30 | -0.168 |
| 2020-01-31 | -0.154 |
| 2020-02-03 | -0.169 |
| 2020-02-04 | -0.19 |
| 2020-02-05 | -0.174 |
| 2020-02-06 | -0.151 |
| 2020-02-07 | -0.173 |
| 2020-02-10 | -0.173 |
| 2020-02-11 | -0.21 |
| 2020-02-12 | -0.186 |
| 2020-02-13 | -0.188 |
| 2020-02-14 | -0.202 |
| 2020-02-17 | -0.201 |
| 2020-02-18 | -0.199 |
| 2020-02-19 | -0.2 |
| 2020-02-20 | -0.197 |
| 2020-02-21 | -0.214 |
| 2020-02-24 | -0.217 |
| 2020-02-25 | -0.201 |
| 2020-02-26 | -0.201 |
| 2020-02-27 | -0.192 |
| 2020-02-28 | -0.197 |
| 2020-03-02 | -0.214 |
| 2020-03-03 | -0.157 |
| 2020-03-04 | -0.174 |
| 2020-03-05 | -0.24 |
| 2020-03-06 | -0.26 |
| 2020-03-09 | -0.313 |
| 2020-03-10 | -0.309 |
| 2020-03-11 | -0.32 |
| 2020-03-12 | -0.245 |
| 2020-03-13 | -0.297 |
| 2020-03-16 | -0.326 |
| 2020-03-17 | -0.396 |
| 2020-03-18 | -0.378 |
| 2020-03-19 | -0.302 |
| 2020-03-20 | -0.414 |
| 2020-03-23 | -0.444 |
| 2020-03-24 | -0.528 |
| 2020-03-25 | -0.588 |
| 2020-03-26 | -0.63 |
| 2020-03-27 | -0.586 |
| 2020-03-30 | -0.611 |
| 2020-03-31 | -0.599 |
| 2020-04-01 | -0.57 |
| 2020-04-02 | -0.545 |
| 2020-04-03 | -0.511 |
| 2020-04-06 | -0.523 |
| 2020-04-07 | -0.539 |
| 2020-04-08 | -0.533 |
| 2020-04-09 | -0.52 |
| 2020-04-10 | -0.52 |
| 2020-04-13 | -0.553 |
| 2020-04-14 | -0.556 |
| 2020-04-15 | -0.534 |
| 2020-04-16 | -0.489 |
| 2020-04-17 | -0.464 |
| 2020-04-20 | -0.473 |
| 2020-04-21 | -0.456 |
| 2020-04-22 | -0.402 |
| 2020-04-23 | -0.389 |
| 2020-04-24 | -0.363 |
| 2020-04-27 | -0.371 |
| 2020-04-28 | -0.359 |
| 2020-04-29 | -0.36 |
| 2020-04-30 | -0.364 |
| 2020-05-01 | -0.363 |
| 2020-05-04 | -0.358 |
| 2020-05-05 | -0.324 |
| 2020-05-06 | -0.348 |
| 2020-05-07 | -0.34 |
| 2020-05-08 | -0.321 |
| 2020-05-11 | -0.301 |
| 2020-05-12 | -0.299 |
| 2020-05-13 | -0.342 |
| 2020-05-14 | -0.328 |
| 2020-05-15 | -0.351 |
| 2020-05-18 | -0.346 |
| 2020-05-19 | -0.362 |
| 2020-05-20 | -0.362 |
| 2020-05-21 | -0.364 |
| 2020-05-22 | -0.368 |
| 2020-05-25 | -0.375 |
| 2020-05-26 | -0.363 |
| 2020-05-27 | -0.409 |
| 2020-05-28 | -0.377 |
| 2020-05-29 | -0.366 |
| 2020-06-01 | -0.337 |
| 2020-06-02 | -0.276 |
| 2020-06-03 | -0.292 |
| 2020-06-04 | -0.275 |
| 2020-06-05 | -0.261 |
| 2020-06-08 | -0.239 |
| 2020-06-09 | -0.21 |
| 2020-06-10 | -0.186 |
| 2020-06-11 | -0.193 |
| 2020-06-12 | -0.172 |
| 2020-06-15 | -0.216 |
| 2020-06-16 | -0.236 |
| 2020-06-17 | -0.217 |
| 2020-06-18 | -0.256 |
| 2020-06-19 | -0.241 |
| 2020-06-22 | -0.21 |
| 2020-06-23 | -0.208 |
| 2020-06-24 | -0.201 |
| 2020-06-25 | -0.174 |
| 2020-06-26 | -0.17 |
| 2020-06-29 | -0.172 |
| 2020-06-30 | -0.178 |
| 2020-07-01 | -0.19 |
| 2020-07-02 | -0.248 |
| 2020-07-03 | -0.255 |
| 2020-07-06 | -0.365 |
| 2020-07-07 | -0.368 |
| 2020-07-08 | -0.352 |
| 2020-07-09 | -0.308 |
| 2020-07-10 | -0.276 |
| 2020-07-13 | -0.292 |
| 2020-07-14 | -0.329 |
| 2020-07-15 | -0.295 |
| 2020-07-16 | -0.295 |
| 2020-07-17 | -0.288 |
| 2020-07-20 | -0.251 |
| 2020-07-21 | -0.301 |
| 2020-07-22 | -0.34 |
| 2020-07-23 | -0.328 |
| 2020-07-24 | -0.381 |
| 2020-07-27 | -0.402 |
| 2020-07-28 | -0.407 |
| 2020-07-29 | -0.438 |
| 2020-07-30 | -0.458 |
| 2020-07-31 | -0.451 |
| 2020-08-03 | -0.473 |
| 2020-08-04 | -0.486 |
| 2020-08-05 | -0.431 |
| 2020-08-06 | -0.393 |
| 2020-08-07 | -0.344 |
| 2020-08-10 | -0.385 |
| 2020-08-11 | -0.349 |
| 2020-08-12 | -0.348 |
| 2020-08-13 | -0.407 |
| 2020-08-14 | -0.407 |
| 2020-08-17 | -0.422 |
| 2020-08-18 | -0.418 |
| 2020-08-19 | -0.402 |
| 2020-08-20 | -0.361 |
| 2020-08-21 | -0.345 |
| 2020-08-24 | -0.319 |
| 2020-08-25 | -0.3 |
| 2020-08-26 | -0.32 |
| 2020-08-27 | -0.332 |
| 2020-08-28 | -0.349 |
| 2020-08-31 | -0.388 |
| 2020-09-01 | -0.428 |
| 2020-09-02 | -0.363 |
| 2020-09-03 | -0.394 |
| 2020-09-04 | -0.386 |
| 2020-09-07 | -0.385 |
| 2020-09-08 | -0.387 |
| 2020-09-09 | -0.389 |
| 2020-09-10 | -0.386 |
| 2020-09-11 | -0.379 |
| 2020-09-14 | -0.379 |
| 2020-09-15 | -0.428 |
| 2020-09-16 | -0.386 |
| 2020-09-17 | -0.388 |
| 2020-09-18 | -0.389 |
| 2020-09-21 | -0.387 |
| 2020-09-22 | -0.385 |
| 2020-09-23 | -0.374 |
| 2020-09-24 | -0.357 |
| 2020-09-25 | -0.343 |
| 2020-09-28 | -0.33 |
| 2020-09-29 | -0.333 |
| 2020-09-30 | -0.349 |
| 2020-10-01 | -0.349 |
| 2020-10-02 | -0.361 |
| 2020-10-05 | -0.35 |
| 2020-10-06 | -0.315 |
| 2020-10-07 | -0.317 |
| 2020-10-08 | -0.325 |
| 2020-10-09 | -0.339 |
| 2020-10-12 | -0.34 |
| 2020-10-13 | -0.354 |
| 2020-10-14 | -0.373 |
| 2020-10-15 | -0.37 |
| 2020-10-16 | -0.373 |
| 2020-10-19 | -0.334 |
| 2020-10-20 | -0.316 |
| 2020-10-21 | -0.308 |
| 2020-10-22 | -0.325 |
| 2020-10-23 | -0.346 |
| 2020-10-26 | -0.336 |
| 2020-10-27 | -0.343 |
| 2020-10-28 | -0.336 |
| 2020-10-29 | -0.34 |
| 2020-10-30 | -0.327 |
| 2020-11-02 | -0.325 |
| 2020-11-03 | -0.271 |
| 2020-11-04 | -0.284 |
| 2020-11-05 | -0.294 |
| 2020-11-06 | -0.294 |
| 2020-11-09 | -0.256 |
| 2020-11-10 | -0.281 |
| 2020-11-11 | -0.291 |
| 2020-11-12 | -0.283 |
| 2020-11-13 | -0.297 |
| 2020-11-16 | -0.311 |
| 2020-11-17 | -0.307 |
| 2020-11-18 | -0.298 |
| 2020-11-19 | -0.286 |
| 2020-11-20 | -0.277 |
| 2020-11-23 | -0.232 |
| 2020-11-24 | -0.197 |
| 2020-11-25 | -0.214 |
| 2020-11-26 | -0.21 |
| 2020-11-27 | -0.222 |
| 2020-11-30 | -0.249 |
| 2020-12-01 | -0.241 |
| 2020-12-02 | -0.194 |
| 2020-12-03 | -0.188 |
| 2020-12-04 | -0.163 |
| 2020-12-07 | -0.241 |
| 2020-12-08 | -0.241 |
| 2020-12-09 | -0.268 |
| 2020-12-10 | -0.308 |
| 2020-12-11 | -0.359 |
| 2020-12-14 | -0.359 |
| 2020-12-15 | -0.354 |
| 2020-12-16 | -0.344 |
| 2020-12-17 | -0.358 |
| 2020-12-18 | -0.34 |
| 2020-12-21 | -0.347 |
| 2020-12-22 | -0.336 |
| 2020-12-23 | -0.339 |
| 2020-12-24 | -0.332 |
| 2020-12-25 | -0.333 |
| 2020-12-28 | -0.33 |
| 2020-12-29 | -0.313 |
| 2020-12-30 | -0.29 |
| 2020-12-31 | -0.291 |
| 2021-01-01 | -0.292 |
| 2021-01-04 | -0.271 |
| 2021-01-05 | -0.297 |
| 2021-01-06 | -0.247 |
| 2021-01-07 | -0.249 |
| 2021-01-08 | -0.247 |
| 2021-01-11 | -0.259 |
| 2021-01-12 | -0.26 |
| 2021-01-13 | -0.29 |
| 2021-01-14 | -0.259 |
| 2021-01-15 | -0.273 |
| 2021-01-18 | -0.271 |
| 2021-01-19 | -0.251 |
| 2021-01-20 | -0.251 |
| 2021-01-21 | -0.229 |
| 2021-01-22 | -0.221 |
| 2021-01-25 | -0.214 |
| 2021-01-26 | -0.203 |
| 2021-01-27 | -0.192 |
| 2021-01-28 | -0.186 |
| 2021-01-29 | -0.188 |
| 2021-02-01 | -0.17 |
| 2021-02-02 | -0.168 |
| 2021-02-03 | -0.125 |
| 2021-02-04 | -0.11 |
| 2021-02-05 | -0.152 |
| 2021-02-08 | -0.127 |
| 2021-02-09 | -0.147 |
| 2021-02-10 | -0.153 |
| 2021-02-11 | -0.125 |
| 2021-02-12 | -0.118 |
| 2021-02-15 | -0.107 |
| 2021-02-16 | -0.119 |
| 2021-02-17 | -0.145 |
| 2021-02-18 | -0.115 |
| 2021-02-19 | -0.078 |
| 2021-02-22 | -0.081 |
| 2021-02-23 | -0.095 |
| 2021-02-24 | -0.109 |
| 2021-02-25 | -0.114 |
| 2021-02-26 | -0.109 |
| 2021-03-01 | -0.055 |
| 2021-03-02 | 0 |
| 2021-03-03 | 0.004 |
| 2021-03-04 | 0.007 |
| 2021-03-05 | -0.019 |
| 2021-03-08 | -0.06 |
| 2021-03-09 | -0.074 |
| 2021-03-10 | -0.053 |
| 2021-03-11 | -0.071 |
| 2021-03-12 | -0.089 |
| 2021-03-15 | -0.119 |
| 2021-03-16 | -0.095 |
| 2021-03-17 | -0.062 |
| 2021-03-18 | -0.033 |
| 2021-03-19 | -0.04 |
| 2021-03-22 | -0.019 |
| 2021-03-23 | -0.019 |
| 2021-03-24 | -0.036 |
| 2021-03-25 | -0.087 |
| 2021-03-26 | -0.115 |
| 2021-03-29 | -0.155 |
| 2021-03-30 | -0.193 |
| 2021-03-31 | -0.197 |
| 2021-04-01 | -0.239 |
| 2021-04-02 | -0.239 |
| 2021-04-05 | -0.219 |
| 2021-04-06 | -0.215 |
| 2021-04-07 | -0.183 |
| 2021-04-08 | -0.163 |
| 2021-04-09 | -0.154 |
| 2021-04-12 | -0.158 |
| 2021-04-13 | -0.187 |
| 2021-04-14 | -0.222 |
| 2021-04-15 | -0.223 |
| 2021-04-16 | -0.209 |
| 2021-04-19 | -0.174 |
| 2021-04-20 | -0.191 |
| 2021-04-21 | -0.209 |
| 2021-04-22 | -0.212 |
| 2021-04-23 | -0.22 |
| 2021-04-26 | -0.212 |
| 2021-04-27 | -0.196 |
| 2021-04-28 | -0.185 |
| 2021-04-29 | -0.203 |
| 2021-04-30 | -0.273 |
| 2021-05-03 | -0.253 |
| 2021-05-04 | -0.261 |
| 2021-05-05 | -0.255 |
| 2021-05-06 | -0.247 |
| 2021-05-07 | -0.267 |
| 2021-05-10 | -0.253 |
| 2021-05-11 | -0.231 |
| 2021-05-12 | -0.206 |
| 2021-05-13 | -0.212 |
| 2021-05-14 | -0.204 |
| 2021-05-17 | -0.16 |
| 2021-05-18 | -0.179 |
| 2021-05-19 | -0.15 |
| 2021-05-20 | -0.089 |
| 2021-05-21 | -0.089 |
| 2021-05-24 | -0.101 |
| 2021-05-25 | -0.089 |
| 2021-05-26 | -0.095 |
| 2021-05-27 | -0.11 |
| 2021-05-28 | -0.134 |
| 2021-05-31 | -0.124 |
| 2021-06-01 | -0.152 |
| 2021-06-02 | -0.132 |
| 2021-06-03 | -0.11 |
| 2021-06-04 | -0.117 |
| 2021-06-07 | -0.124 |
| 2021-06-08 | -0.12 |
| 2021-06-09 | -0.129 |
| 2021-06-10 | -0.143 |
| 2021-06-11 | -0.025 |
| 2021-06-14 | -0.021 |
| 2021-06-15 | -0.022 |
| 2021-06-16 | -0.038 |
| 2021-06-17 | -0.02 |
| 2021-06-18 | -0.031 |
| 2021-06-21 | -0.031 |
| 2021-06-22 | -0.016 |
| 2021-06-23 | -0.041 |
| 2021-06-24 | -0.066 |
| 2021-06-25 | -0.106 |
| 2021-06-28 | -0.106 |
| 2021-06-29 | -0.092 |
| 2021-06-30 | -0.079 |
| 2021-07-01 | -0.053 |
| 2021-07-02 | -0.033 |
| 2021-07-05 | -0.027 |
| 2021-07-06 | -0.086 |
| 2021-07-07 | -0.108 |
| 2021-07-08 | -0.139 |
| 2021-07-09 | -0.135 |
| 2021-07-12 | -0.112 |
| 2021-07-13 | -0.106 |
| 2021-07-14 | -0.133 |
| 2021-07-15 | -0.125 |
| 2021-07-16 | -0.125 |
| 2021-07-19 | -0.112 |
| 2021-07-20 | -0.077 |
| 2021-07-21 | -0.039 |
| 2021-07-22 | -0.055 |
| 2021-07-23 | -0.032 |
| 2021-07-26 | -0.026 |
| 2021-07-27 | -0.065 |
| 2021-07-28 | -0.069 |
| 2021-07-29 | -0.073 |
| 2021-07-30 | -0.062 |
| 2021-08-02 | -0.068 |
| 2021-08-03 | -0.033 |
| 2021-08-04 | -0.004 |
| 2021-08-05 | -0.023 |
| 2021-08-06 | -0.026 |
| 2021-08-09 | -0.008 |
| 2021-08-10 | -0.021 |
| 2021-08-11 | 0.081 |
| 2021-08-12 | 0.093 |
| 2021-08-13 | 0.113 |
| 2021-08-16 | 0.135 |
| 2021-08-17 | 0.071 |
| 2021-08-18 | -0.008 |
| 2021-08-19 | 0.008 |
| 2021-08-20 | 0.042 |
| 2021-08-23 | 0.054 |
| 2021-08-24 | 0.047 |
| 2021-08-25 | 0.031 |
| 2021-08-26 | 0.024 |
| 2021-08-27 | -0.017 |
| 2021-08-30 | -0.028 |
| 2021-08-31 | -0.025 |
| 2021-09-01 | -0.065 |
| 2021-09-02 | -0.035 |
| 2021-09-03 | 0.013 |
| 2021-09-06 | 0.031 |
| 2021-09-07 | 0.019 |
| 2021-09-08 | 0.093 |
| 2021-09-09 | 0.149 |
| 2021-09-10 | 0.163 |
| 2021-09-13 | 0.059 |
| 2021-09-14 | 0.131 |
| 2021-09-15 | 0.118 |
| 2021-09-16 | 0.122 |
| 2021-09-17 | 0.122 |
| 2021-09-20 | 0.081 |
| 2021-09-21 | 0.074 |
| 2021-09-22 | 0.092 |
| 2021-09-23 | 0.087 |
| 2021-09-24 | 0.057 |
| 2021-09-27 | 0.079 |
| 2021-09-28 | 0.128 |
| 2021-09-29 | 0.121 |
| 2021-09-30 | 0.066 |
| 2021-10-01 | 0.022 |
| 2021-10-04 | 0.03 |
| 2021-10-05 | 0.017 |
| 2021-10-06 | 0.029 |
| 2021-10-07 | 0.007 |
| 2021-10-08 | 0.004 |
| 2021-10-11 | 0.004 |
| 2021-10-12 | -0.005 |
| 2021-10-13 | -0.113 |
| 2021-10-14 | -0.307 |
| 2021-10-15 | -0.274 |
| 2021-10-18 | -0.248 |
| 2021-10-19 | -0.164 |
| 2021-10-20 | -0.142 |
| 2021-10-21 | -0.116 |
| 2021-10-22 | -0.094 |
| 2021-10-25 | -0.096 |
| 2021-10-26 | -0.012 |
| 2021-10-27 | 0.046 |
| 2021-10-28 | 0.067 |
| 2021-10-29 | 0.204 |
| 2021-11-01 | 0.204 |
| 2021-11-02 | 0.278 |
| 2021-11-03 | 0.354 |
| 2021-11-04 | 0.475 |
| 2021-11-05 | 0.43 |
| 2021-11-08 | 0.486 |
| 2021-11-09 | 0.478 |
| 2021-11-10 | 0.429 |
| 2021-11-11 | 0.465 |
| 2021-11-12 | 0.41 |
| 2021-11-15 | 0.41 |
| 2021-11-16 | 0.418 |
| 2021-11-17 | 0.395 |
| 2021-11-18 | 0.456 |
| 2021-11-19 | 0.432 |
| 2021-11-22 | 0.196 |
| 2021-11-23 | 0.13 |
| 2021-11-24 | 0.054 |
| 2021-11-25 | 0.042 |
| 2021-11-26 | 0.039 |
| 2021-11-29 | 0.028 |
| 2021-11-30 | 0.04 |
| 2021-12-01 | 0.026 |
| 2021-12-02 | 0.006 |
| 2021-12-03 | -0.013 |
| 2021-12-06 | 0.026 |
| 2021-12-07 | 0.056 |
| 2021-12-08 | 0.056 |
| 2021-12-09 | 0.053 |
| 2021-12-10 | 0.105 |
| 2021-12-13 | 0.175 |
| 2021-12-14 | 0.193 |
| 2021-12-15 | 0.262 |
| 2021-12-16 | 0.327 |
| 2021-12-17 | 0.387 |
| 2021-12-20 | 0.395 |
| 2021-12-21 | 0.399 |
| 2021-12-22 | 0.372 |
| 2021-12-23 | 0.271 |
| 2021-12-24 | 0.259 |
| 2021-12-27 | 0.214 |
| 2021-12-28 | 0.229 |
| 2021-12-29 | 0.245 |
| 2021-12-30 | 0.225 |
| 2021-12-31 | 0.225 |
| 2022-01-03 | 0.247 |
| 2022-01-04 | 0.267 |
| 2022-01-05 | 0.319 |
| 2022-01-06 | 0.344 |
| 2022-01-07 | 0.404 |
| 2022-01-10 | 0.507 |
| 2022-01-11 | 0.543 |
| 2022-01-12 | 0.591 |
| 2022-01-13 | 0.754 |
| 2022-01-14 | 0.703 |
| 2022-01-17 | 0.727 |
| 2022-01-18 | 0.684 |
| 2022-01-19 | 0.636 |
| 2022-01-20 | 0.643 |
| 2022-01-21 | 0.574 |
| 2022-01-24 | 0.531 |
| 2022-01-25 | 0.496 |
| 2022-01-26 | 0.551 |
| 2022-01-27 | 0.476 |
| 2022-01-28 | 0.495 |
| 2022-01-31 | 0.571 |
| 2022-02-01 | 0.648 |
| 2022-02-02 | 0.659 |
| 2022-02-03 | 0.683 |
| 2022-02-04 | 0.654 |
| 2022-02-07 | 0.606 |
| 2022-02-08 | 0.517 |
| 2022-02-09 | 0.444 |
| 2022-02-10 | 0.398 |
| 2022-02-11 | 0.263 |
| 2022-02-14 | 0.277 |
| 2022-02-15 | 0.305 |
| 2022-02-16 | 0.382 |
| 2022-02-17 | 0.414 |
| 2022-02-18 | 0.515 |
| 2022-02-21 | 0.492 |
| 2022-02-22 | 0.477 |
| 2022-02-23 | 0.59 |
| 2022-02-24 | 0.683 |
| 2022-02-25 | 0.714 |
| 2022-02-28 | 0.759 |
| 2022-03-01 | 0.834 |
| 2022-03-02 | 0.88 |
| 2022-03-03 | 0.933 |
| 2022-03-04 | 1.051 |
| 2022-03-07 | 1.295 |
| 2022-03-08 | 1.375 |
| 2022-03-09 | 1.38 |
| 2022-03-10 | 1.39 |
| 2022-03-11 | 1.349 |
| 2022-03-14 | 1.211 |
| 2022-03-15 | 1.061 |
| 2022-03-16 | 1.019 |
| 2022-03-17 | 0.99 |
| 2022-03-18 | 0.989 |
| 2022-03-21 | 1.115 |
| 2022-03-22 | 1.264 |
| 2022-03-23 | 1.219 |
| 2022-03-24 | 1.231 |